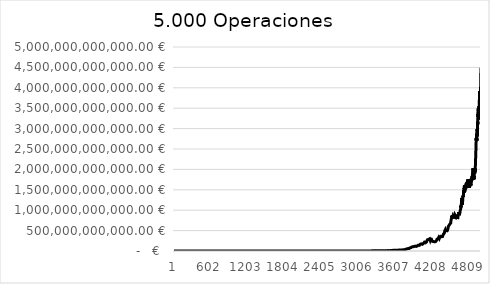
| Category | Series 0 |
|---|---|
| 0 | 10200 |
| 1 | 10404 |
| 2 | 10195.92 |
| 3 | 9992.002 |
| 4 | 10191.842 |
| 5 | 9988.005 |
| 6 | 9788.245 |
| 7 | 9592.48 |
| 8 | 9784.329 |
| 9 | 9588.643 |
| 10 | 9780.416 |
| 11 | 9584.807 |
| 12 | 9776.504 |
| 13 | 9580.973 |
| 14 | 9389.354 |
| 15 | 9201.567 |
| 16 | 9385.598 |
| 17 | 9573.31 |
| 18 | 9764.776 |
| 19 | 9960.072 |
| 20 | 9760.87 |
| 21 | 9956.088 |
| 22 | 9756.966 |
| 23 | 9952.105 |
| 24 | 10151.148 |
| 25 | 10354.171 |
| 26 | 10561.254 |
| 27 | 10772.479 |
| 28 | 10987.929 |
| 29 | 11207.687 |
| 30 | 11431.841 |
| 31 | 11660.478 |
| 32 | 11427.268 |
| 33 | 11198.723 |
| 34 | 11422.697 |
| 35 | 11651.151 |
| 36 | 11884.174 |
| 37 | 11646.491 |
| 38 | 11413.561 |
| 39 | 11641.832 |
| 40 | 11408.996 |
| 41 | 11180.816 |
| 42 | 11404.432 |
| 43 | 11176.343 |
| 44 | 10952.816 |
| 45 | 11171.873 |
| 46 | 11395.31 |
| 47 | 11623.216 |
| 48 | 11855.681 |
| 49 | 11618.567 |
| 50 | 11850.938 |
| 51 | 12087.957 |
| 52 | 12329.716 |
| 53 | 12083.122 |
| 54 | 12324.784 |
| 55 | 12571.28 |
| 56 | 12319.855 |
| 57 | 12566.252 |
| 58 | 12817.577 |
| 59 | 12561.225 |
| 60 | 12812.45 |
| 61 | 12556.201 |
| 62 | 12807.325 |
| 63 | 12551.178 |
| 64 | 12802.202 |
| 65 | 12546.158 |
| 66 | 12797.081 |
| 67 | 13053.022 |
| 68 | 12791.962 |
| 69 | 13047.801 |
| 70 | 13308.757 |
| 71 | 13042.582 |
| 72 | 12781.731 |
| 73 | 13037.365 |
| 74 | 13298.112 |
| 75 | 13564.075 |
| 76 | 13292.793 |
| 77 | 13026.937 |
| 78 | 12766.399 |
| 79 | 12511.071 |
| 80 | 12761.292 |
| 81 | 12506.066 |
| 82 | 12756.187 |
| 83 | 12501.064 |
| 84 | 12751.085 |
| 85 | 13006.107 |
| 86 | 13266.229 |
| 87 | 13000.904 |
| 88 | 13260.922 |
| 89 | 13526.141 |
| 90 | 13796.664 |
| 91 | 14072.597 |
| 92 | 14354.049 |
| 93 | 14641.13 |
| 94 | 14933.952 |
| 95 | 15232.631 |
| 96 | 15537.284 |
| 97 | 15848.03 |
| 98 | 15531.069 |
| 99 | 15220.448 |
| 100 | 14916.039 |
| 101 | 15214.36 |
| 102 | 14910.072 |
| 103 | 15208.274 |
| 104 | 14904.108 |
| 105 | 14606.026 |
| 106 | 14313.906 |
| 107 | 14600.184 |
| 108 | 14892.187 |
| 109 | 15190.031 |
| 110 | 14886.231 |
| 111 | 15183.955 |
| 112 | 15487.634 |
| 113 | 15797.387 |
| 114 | 16113.335 |
| 115 | 15791.068 |
| 116 | 16106.889 |
| 117 | 16429.027 |
| 118 | 16100.447 |
| 119 | 16422.456 |
| 120 | 16750.905 |
| 121 | 17085.923 |
| 122 | 17427.641 |
| 123 | 17776.194 |
| 124 | 18131.718 |
| 125 | 18494.352 |
| 126 | 18124.465 |
| 127 | 18486.955 |
| 128 | 18856.694 |
| 129 | 19233.828 |
| 130 | 19618.504 |
| 131 | 20010.874 |
| 132 | 20411.092 |
| 133 | 20002.87 |
| 134 | 20402.927 |
| 135 | 20810.986 |
| 136 | 20394.766 |
| 137 | 19986.871 |
| 138 | 20386.608 |
| 139 | 19978.876 |
| 140 | 20378.454 |
| 141 | 19970.884 |
| 142 | 19571.467 |
| 143 | 19180.037 |
| 144 | 19563.638 |
| 145 | 19172.365 |
| 146 | 18788.918 |
| 147 | 18413.14 |
| 148 | 18781.403 |
| 149 | 19157.031 |
| 150 | 19540.171 |
| 151 | 19930.975 |
| 152 | 20329.594 |
| 153 | 20736.186 |
| 154 | 21150.91 |
| 155 | 21573.928 |
| 156 | 21142.449 |
| 157 | 20719.6 |
| 158 | 21133.992 |
| 159 | 20711.313 |
| 160 | 20297.086 |
| 161 | 20703.028 |
| 162 | 21117.089 |
| 163 | 21539.43 |
| 164 | 21108.642 |
| 165 | 21530.815 |
| 166 | 21961.431 |
| 167 | 22400.659 |
| 168 | 22848.673 |
| 169 | 22391.699 |
| 170 | 22839.533 |
| 171 | 23296.324 |
| 172 | 23762.25 |
| 173 | 23287.005 |
| 174 | 22821.265 |
| 175 | 22364.84 |
| 176 | 21917.543 |
| 177 | 21479.192 |
| 178 | 21908.776 |
| 179 | 22346.952 |
| 180 | 21900.013 |
| 181 | 21462.012 |
| 182 | 21891.253 |
| 183 | 22329.078 |
| 184 | 22775.659 |
| 185 | 22320.146 |
| 186 | 22766.549 |
| 187 | 23221.88 |
| 188 | 22757.442 |
| 189 | 23212.591 |
| 190 | 23676.843 |
| 191 | 23203.306 |
| 192 | 22739.24 |
| 193 | 23194.025 |
| 194 | 23657.905 |
| 195 | 24131.063 |
| 196 | 23648.442 |
| 197 | 23175.473 |
| 198 | 22711.964 |
| 199 | 23166.203 |
| 200 | 23629.527 |
| 201 | 23156.937 |
| 202 | 22693.798 |
| 203 | 23147.674 |
| 204 | 23610.627 |
| 205 | 24082.84 |
| 206 | 23601.183 |
| 207 | 24073.207 |
| 208 | 23591.743 |
| 209 | 24063.577 |
| 210 | 24544.849 |
| 211 | 24053.952 |
| 212 | 23572.873 |
| 213 | 23101.415 |
| 214 | 23563.444 |
| 215 | 24034.713 |
| 216 | 24515.407 |
| 217 | 25005.715 |
| 218 | 25505.829 |
| 219 | 26015.946 |
| 220 | 25495.627 |
| 221 | 26005.54 |
| 222 | 26525.65 |
| 223 | 27056.163 |
| 224 | 27597.287 |
| 225 | 28149.232 |
| 226 | 28712.217 |
| 227 | 28137.973 |
| 228 | 28700.732 |
| 229 | 29274.747 |
| 230 | 29860.242 |
| 231 | 30457.447 |
| 232 | 29848.298 |
| 233 | 30445.264 |
| 234 | 31054.169 |
| 235 | 30433.085 |
| 236 | 31041.747 |
| 237 | 30420.912 |
| 238 | 31029.33 |
| 239 | 31649.917 |
| 240 | 32282.915 |
| 241 | 31637.257 |
| 242 | 32270.002 |
| 243 | 32915.402 |
| 244 | 32257.094 |
| 245 | 32902.236 |
| 246 | 32244.191 |
| 247 | 32889.075 |
| 248 | 32231.294 |
| 249 | 32875.92 |
| 250 | 32218.401 |
| 251 | 32862.769 |
| 252 | 33520.025 |
| 253 | 32849.624 |
| 254 | 32192.632 |
| 255 | 31548.779 |
| 256 | 32179.755 |
| 257 | 32823.35 |
| 258 | 32166.883 |
| 259 | 31523.545 |
| 260 | 32154.016 |
| 261 | 32797.096 |
| 262 | 33453.038 |
| 263 | 34122.099 |
| 264 | 33439.657 |
| 265 | 34108.45 |
| 266 | 34790.619 |
| 267 | 35486.432 |
| 268 | 34776.703 |
| 269 | 35472.237 |
| 270 | 36181.682 |
| 271 | 36905.315 |
| 272 | 36167.209 |
| 273 | 36890.553 |
| 274 | 36152.742 |
| 275 | 36875.797 |
| 276 | 36138.281 |
| 277 | 36861.047 |
| 278 | 36123.826 |
| 279 | 36846.302 |
| 280 | 36109.376 |
| 281 | 36831.564 |
| 282 | 36094.932 |
| 283 | 36816.831 |
| 284 | 37553.168 |
| 285 | 38304.231 |
| 286 | 37538.146 |
| 287 | 36787.384 |
| 288 | 37523.131 |
| 289 | 36772.669 |
| 290 | 37508.122 |
| 291 | 38258.284 |
| 292 | 37493.119 |
| 293 | 38242.981 |
| 294 | 39007.841 |
| 295 | 39787.997 |
| 296 | 40583.757 |
| 297 | 39772.082 |
| 298 | 40567.524 |
| 299 | 41378.874 |
| 300 | 42206.452 |
| 301 | 43050.581 |
| 302 | 42189.569 |
| 303 | 43033.361 |
| 304 | 43894.028 |
| 305 | 44771.908 |
| 306 | 43876.47 |
| 307 | 44754 |
| 308 | 45649.08 |
| 309 | 46562.061 |
| 310 | 47493.303 |
| 311 | 48443.169 |
| 312 | 49412.032 |
| 313 | 48423.791 |
| 314 | 47455.315 |
| 315 | 48404.422 |
| 316 | 49372.51 |
| 317 | 48385.06 |
| 318 | 49352.761 |
| 319 | 50339.816 |
| 320 | 49333.02 |
| 321 | 48346.36 |
| 322 | 47379.433 |
| 323 | 46431.844 |
| 324 | 45503.207 |
| 325 | 46413.271 |
| 326 | 47341.537 |
| 327 | 46394.706 |
| 328 | 47322.6 |
| 329 | 48269.052 |
| 330 | 49234.433 |
| 331 | 48249.744 |
| 332 | 49214.739 |
| 333 | 50199.034 |
| 334 | 51203.015 |
| 335 | 50178.954 |
| 336 | 51182.533 |
| 337 | 52206.184 |
| 338 | 51162.06 |
| 339 | 50138.819 |
| 340 | 49136.043 |
| 341 | 50118.764 |
| 342 | 49116.388 |
| 343 | 50098.716 |
| 344 | 49096.742 |
| 345 | 48114.807 |
| 346 | 49077.103 |
| 347 | 50058.645 |
| 348 | 51059.818 |
| 349 | 52081.015 |
| 350 | 53122.635 |
| 351 | 52060.182 |
| 352 | 51018.978 |
| 353 | 52039.358 |
| 354 | 50998.571 |
| 355 | 52018.542 |
| 356 | 50978.171 |
| 357 | 51997.735 |
| 358 | 50957.78 |
| 359 | 49938.625 |
| 360 | 50937.397 |
| 361 | 49918.649 |
| 362 | 50917.022 |
| 363 | 49898.682 |
| 364 | 50896.655 |
| 365 | 51914.588 |
| 366 | 50876.297 |
| 367 | 49858.771 |
| 368 | 50855.946 |
| 369 | 51873.065 |
| 370 | 50835.604 |
| 371 | 49818.892 |
| 372 | 48822.514 |
| 373 | 49798.964 |
| 374 | 48802.985 |
| 375 | 49779.045 |
| 376 | 48783.464 |
| 377 | 49759.133 |
| 378 | 50754.316 |
| 379 | 49739.229 |
| 380 | 50734.014 |
| 381 | 51748.694 |
| 382 | 52783.668 |
| 383 | 51727.995 |
| 384 | 50693.435 |
| 385 | 49679.566 |
| 386 | 48685.975 |
| 387 | 49659.694 |
| 388 | 50652.888 |
| 389 | 49639.83 |
| 390 | 50632.627 |
| 391 | 49619.974 |
| 392 | 48627.575 |
| 393 | 47655.023 |
| 394 | 46701.923 |
| 395 | 47635.961 |
| 396 | 46683.242 |
| 397 | 47616.907 |
| 398 | 48569.245 |
| 399 | 49540.63 |
| 400 | 50531.443 |
| 401 | 51542.072 |
| 402 | 52572.913 |
| 403 | 53624.371 |
| 404 | 54696.859 |
| 405 | 55790.796 |
| 406 | 54674.98 |
| 407 | 53581.48 |
| 408 | 54653.11 |
| 409 | 53560.048 |
| 410 | 54631.249 |
| 411 | 55723.874 |
| 412 | 56838.351 |
| 413 | 57975.118 |
| 414 | 56815.616 |
| 415 | 55679.303 |
| 416 | 56792.89 |
| 417 | 57928.747 |
| 418 | 59087.322 |
| 419 | 60269.069 |
| 420 | 59063.687 |
| 421 | 60244.961 |
| 422 | 61449.86 |
| 423 | 60220.863 |
| 424 | 61425.28 |
| 425 | 62653.786 |
| 426 | 63906.862 |
| 427 | 65184.999 |
| 428 | 66488.699 |
| 429 | 65158.925 |
| 430 | 66462.103 |
| 431 | 65132.861 |
| 432 | 63830.204 |
| 433 | 62553.6 |
| 434 | 63804.672 |
| 435 | 65080.765 |
| 436 | 66382.381 |
| 437 | 65054.733 |
| 438 | 66355.828 |
| 439 | 67682.944 |
| 440 | 66329.286 |
| 441 | 65002.7 |
| 442 | 63702.646 |
| 443 | 62428.593 |
| 444 | 63677.165 |
| 445 | 62403.621 |
| 446 | 61155.549 |
| 447 | 62378.66 |
| 448 | 63626.233 |
| 449 | 64898.758 |
| 450 | 66196.733 |
| 451 | 64872.798 |
| 452 | 63575.342 |
| 453 | 62303.836 |
| 454 | 63549.912 |
| 455 | 64820.91 |
| 456 | 63524.492 |
| 457 | 62254.002 |
| 458 | 63499.082 |
| 459 | 64769.064 |
| 460 | 66064.445 |
| 461 | 67385.734 |
| 462 | 68733.449 |
| 463 | 70108.118 |
| 464 | 71510.28 |
| 465 | 70080.075 |
| 466 | 68678.473 |
| 467 | 67304.904 |
| 468 | 68651.002 |
| 469 | 70024.022 |
| 470 | 68623.541 |
| 471 | 67251.071 |
| 472 | 68596.092 |
| 473 | 69968.014 |
| 474 | 71367.374 |
| 475 | 72794.722 |
| 476 | 74250.616 |
| 477 | 75735.628 |
| 478 | 74220.916 |
| 479 | 72736.498 |
| 480 | 71281.768 |
| 481 | 69856.132 |
| 482 | 71253.255 |
| 483 | 72678.32 |
| 484 | 74131.886 |
| 485 | 72649.249 |
| 486 | 74102.234 |
| 487 | 75584.278 |
| 488 | 77095.964 |
| 489 | 78637.883 |
| 490 | 80210.641 |
| 491 | 81814.854 |
| 492 | 83451.151 |
| 493 | 85120.174 |
| 494 | 86822.577 |
| 495 | 85086.126 |
| 496 | 86787.848 |
| 497 | 85052.091 |
| 498 | 86753.133 |
| 499 | 85018.07 |
| 500 | 83317.709 |
| 501 | 84984.063 |
| 502 | 83284.382 |
| 503 | 84950.069 |
| 504 | 83251.068 |
| 505 | 84916.089 |
| 506 | 86614.411 |
| 507 | 88346.699 |
| 508 | 90113.633 |
| 509 | 91915.906 |
| 510 | 93754.224 |
| 511 | 91879.14 |
| 512 | 93716.723 |
| 513 | 95591.057 |
| 514 | 93679.236 |
| 515 | 91805.651 |
| 516 | 89969.538 |
| 517 | 91768.929 |
| 518 | 89933.55 |
| 519 | 91732.221 |
| 520 | 93566.866 |
| 521 | 95438.203 |
| 522 | 97346.967 |
| 523 | 99293.906 |
| 524 | 97308.028 |
| 525 | 95361.868 |
| 526 | 97269.105 |
| 527 | 99214.487 |
| 528 | 101198.777 |
| 529 | 99174.801 |
| 530 | 101158.297 |
| 531 | 103181.463 |
| 532 | 101117.834 |
| 533 | 99095.477 |
| 534 | 101077.387 |
| 535 | 99055.839 |
| 536 | 101036.956 |
| 537 | 103057.695 |
| 538 | 100996.541 |
| 539 | 98976.61 |
| 540 | 100956.143 |
| 541 | 102975.266 |
| 542 | 105034.771 |
| 543 | 107135.466 |
| 544 | 109278.176 |
| 545 | 111463.739 |
| 546 | 113693.014 |
| 547 | 111419.154 |
| 548 | 113647.537 |
| 549 | 115920.487 |
| 550 | 113602.078 |
| 551 | 111330.036 |
| 552 | 113556.637 |
| 553 | 115827.77 |
| 554 | 113511.214 |
| 555 | 115781.438 |
| 556 | 113465.81 |
| 557 | 111196.493 |
| 558 | 108972.564 |
| 559 | 111152.015 |
| 560 | 113375.055 |
| 561 | 115642.556 |
| 562 | 117955.407 |
| 563 | 115596.299 |
| 564 | 117908.225 |
| 565 | 120266.39 |
| 566 | 117861.062 |
| 567 | 115503.841 |
| 568 | 117813.918 |
| 569 | 120170.196 |
| 570 | 117766.792 |
| 571 | 115411.456 |
| 572 | 117719.685 |
| 573 | 120074.079 |
| 574 | 122475.561 |
| 575 | 120026.049 |
| 576 | 117625.528 |
| 577 | 119978.039 |
| 578 | 122377.6 |
| 579 | 124825.152 |
| 580 | 127321.655 |
| 581 | 124775.222 |
| 582 | 122279.717 |
| 583 | 124725.312 |
| 584 | 127219.818 |
| 585 | 129764.214 |
| 586 | 127168.93 |
| 587 | 129712.308 |
| 588 | 132306.555 |
| 589 | 129660.423 |
| 590 | 132253.632 |
| 591 | 134898.705 |
| 592 | 132200.73 |
| 593 | 134844.745 |
| 594 | 137541.64 |
| 595 | 140292.473 |
| 596 | 143098.322 |
| 597 | 145960.289 |
| 598 | 148879.494 |
| 599 | 145901.905 |
| 600 | 148819.943 |
| 601 | 145843.544 |
| 602 | 148760.415 |
| 603 | 151735.623 |
| 604 | 154770.335 |
| 605 | 157865.742 |
| 606 | 161023.057 |
| 607 | 164243.518 |
| 608 | 167528.389 |
| 609 | 164177.821 |
| 610 | 167461.377 |
| 611 | 164112.15 |
| 612 | 160829.907 |
| 613 | 157613.308 |
| 614 | 160765.575 |
| 615 | 157550.263 |
| 616 | 154399.258 |
| 617 | 157487.243 |
| 618 | 154337.498 |
| 619 | 151250.748 |
| 620 | 154275.763 |
| 621 | 157361.278 |
| 622 | 154214.053 |
| 623 | 151129.772 |
| 624 | 148107.176 |
| 625 | 145145.033 |
| 626 | 148047.934 |
| 627 | 151008.892 |
| 628 | 147988.714 |
| 629 | 150948.489 |
| 630 | 147929.519 |
| 631 | 144970.928 |
| 632 | 147870.347 |
| 633 | 144912.94 |
| 634 | 147811.199 |
| 635 | 150767.423 |
| 636 | 147752.074 |
| 637 | 144797.033 |
| 638 | 147692.974 |
| 639 | 144739.114 |
| 640 | 147633.896 |
| 641 | 150586.574 |
| 642 | 153598.306 |
| 643 | 150526.34 |
| 644 | 153536.867 |
| 645 | 156607.604 |
| 646 | 153475.452 |
| 647 | 156544.961 |
| 648 | 159675.86 |
| 649 | 162869.377 |
| 650 | 166126.765 |
| 651 | 169449.3 |
| 652 | 166060.314 |
| 653 | 169381.52 |
| 654 | 172769.151 |
| 655 | 169313.768 |
| 656 | 172700.043 |
| 657 | 176154.044 |
| 658 | 179677.125 |
| 659 | 183270.667 |
| 660 | 186936.081 |
| 661 | 190674.802 |
| 662 | 186861.306 |
| 663 | 190598.532 |
| 664 | 194410.503 |
| 665 | 190522.293 |
| 666 | 186711.847 |
| 667 | 182977.61 |
| 668 | 179318.058 |
| 669 | 182904.419 |
| 670 | 179246.331 |
| 671 | 182831.257 |
| 672 | 179174.632 |
| 673 | 175591.14 |
| 674 | 179102.962 |
| 675 | 182685.022 |
| 676 | 186338.722 |
| 677 | 190065.496 |
| 678 | 193866.806 |
| 679 | 197744.143 |
| 680 | 193789.26 |
| 681 | 189913.474 |
| 682 | 193711.744 |
| 683 | 197585.979 |
| 684 | 193634.259 |
| 685 | 197506.944 |
| 686 | 193556.806 |
| 687 | 197427.942 |
| 688 | 193479.383 |
| 689 | 197348.971 |
| 690 | 201295.95 |
| 691 | 205321.869 |
| 692 | 201215.432 |
| 693 | 197191.123 |
| 694 | 201134.945 |
| 695 | 205157.644 |
| 696 | 209260.797 |
| 697 | 213446.013 |
| 698 | 217714.933 |
| 699 | 213360.635 |
| 700 | 209093.422 |
| 701 | 213275.29 |
| 702 | 209009.785 |
| 703 | 213189.98 |
| 704 | 217453.78 |
| 705 | 213104.704 |
| 706 | 217366.798 |
| 707 | 221714.134 |
| 708 | 226148.417 |
| 709 | 221625.449 |
| 710 | 226057.958 |
| 711 | 230579.117 |
| 712 | 235190.699 |
| 713 | 239894.513 |
| 714 | 244692.403 |
| 715 | 249586.252 |
| 716 | 244594.526 |
| 717 | 249486.417 |
| 718 | 254476.145 |
| 719 | 259565.668 |
| 720 | 254374.355 |
| 721 | 259461.842 |
| 722 | 264651.079 |
| 723 | 269944.1 |
| 724 | 275342.982 |
| 725 | 280849.842 |
| 726 | 286466.839 |
| 727 | 280737.502 |
| 728 | 275122.752 |
| 729 | 269620.297 |
| 730 | 264227.891 |
| 731 | 269512.449 |
| 732 | 264122.2 |
| 733 | 269404.644 |
| 734 | 264016.551 |
| 735 | 269296.882 |
| 736 | 274682.82 |
| 737 | 280176.476 |
| 738 | 285780.006 |
| 739 | 291495.606 |
| 740 | 297325.518 |
| 741 | 291379.008 |
| 742 | 285551.427 |
| 743 | 279840.399 |
| 744 | 285437.207 |
| 745 | 279728.463 |
| 746 | 285323.032 |
| 747 | 279616.571 |
| 748 | 274024.24 |
| 749 | 279504.725 |
| 750 | 273914.63 |
| 751 | 279392.923 |
| 752 | 284980.781 |
| 753 | 279281.166 |
| 754 | 273695.542 |
| 755 | 279169.453 |
| 756 | 284752.842 |
| 757 | 279057.785 |
| 758 | 284638.941 |
| 759 | 278946.162 |
| 760 | 273367.239 |
| 761 | 278834.584 |
| 762 | 284411.275 |
| 763 | 278723.05 |
| 764 | 284297.511 |
| 765 | 289983.461 |
| 766 | 295783.13 |
| 767 | 301698.793 |
| 768 | 307732.769 |
| 769 | 301578.113 |
| 770 | 295546.551 |
| 771 | 289635.62 |
| 772 | 295428.333 |
| 773 | 301336.899 |
| 774 | 307363.637 |
| 775 | 313510.91 |
| 776 | 319781.128 |
| 777 | 326176.751 |
| 778 | 319653.216 |
| 779 | 313260.151 |
| 780 | 319525.354 |
| 781 | 325915.862 |
| 782 | 319397.544 |
| 783 | 313009.593 |
| 784 | 306749.402 |
| 785 | 312884.39 |
| 786 | 306626.702 |
| 787 | 312759.236 |
| 788 | 319014.421 |
| 789 | 325394.709 |
| 790 | 331902.603 |
| 791 | 325264.551 |
| 792 | 331769.842 |
| 793 | 325134.445 |
| 794 | 331637.134 |
| 795 | 338269.877 |
| 796 | 331504.479 |
| 797 | 338134.569 |
| 798 | 331371.877 |
| 799 | 324744.44 |
| 800 | 331239.329 |
| 801 | 324614.542 |
| 802 | 318122.251 |
| 803 | 311759.806 |
| 804 | 317995.002 |
| 805 | 311635.102 |
| 806 | 317867.804 |
| 807 | 311510.448 |
| 808 | 317740.657 |
| 809 | 324095.47 |
| 810 | 330577.38 |
| 811 | 323965.832 |
| 812 | 330445.149 |
| 813 | 337054.052 |
| 814 | 330312.971 |
| 815 | 336919.23 |
| 816 | 330180.846 |
| 817 | 323577.229 |
| 818 | 330048.773 |
| 819 | 336649.749 |
| 820 | 343382.744 |
| 821 | 350250.399 |
| 822 | 357255.407 |
| 823 | 364400.515 |
| 824 | 371688.525 |
| 825 | 364254.755 |
| 826 | 356969.659 |
| 827 | 364109.053 |
| 828 | 371391.234 |
| 829 | 363963.409 |
| 830 | 371242.677 |
| 831 | 378667.531 |
| 832 | 371094.18 |
| 833 | 378516.064 |
| 834 | 386086.385 |
| 835 | 378364.657 |
| 836 | 370797.364 |
| 837 | 363381.417 |
| 838 | 370649.045 |
| 839 | 378062.026 |
| 840 | 385623.267 |
| 841 | 377910.801 |
| 842 | 370352.585 |
| 843 | 362945.534 |
| 844 | 370204.444 |
| 845 | 362800.355 |
| 846 | 370056.362 |
| 847 | 362655.235 |
| 848 | 369908.34 |
| 849 | 377306.507 |
| 850 | 384852.637 |
| 851 | 377155.584 |
| 852 | 369612.472 |
| 853 | 377004.722 |
| 854 | 384544.816 |
| 855 | 376853.92 |
| 856 | 384390.998 |
| 857 | 392078.818 |
| 858 | 399920.395 |
| 859 | 391921.987 |
| 860 | 399760.427 |
| 861 | 407755.635 |
| 862 | 399600.522 |
| 863 | 391608.512 |
| 864 | 399440.682 |
| 865 | 391451.869 |
| 866 | 383622.831 |
| 867 | 375950.375 |
| 868 | 368431.367 |
| 869 | 361062.74 |
| 870 | 368283.994 |
| 871 | 360918.315 |
| 872 | 368136.681 |
| 873 | 375499.415 |
| 874 | 383009.403 |
| 875 | 375349.215 |
| 876 | 382856.199 |
| 877 | 375199.075 |
| 878 | 367695.094 |
| 879 | 375048.995 |
| 880 | 382549.975 |
| 881 | 374898.976 |
| 882 | 382396.955 |
| 883 | 390044.894 |
| 884 | 382243.997 |
| 885 | 389888.876 |
| 886 | 397686.654 |
| 887 | 405640.387 |
| 888 | 397527.579 |
| 889 | 405478.131 |
| 890 | 397368.568 |
| 891 | 389421.197 |
| 892 | 397209.621 |
| 893 | 405153.813 |
| 894 | 397050.737 |
| 895 | 404991.752 |
| 896 | 396891.917 |
| 897 | 388954.078 |
| 898 | 396733.16 |
| 899 | 388798.497 |
| 900 | 396574.467 |
| 901 | 388642.977 |
| 902 | 396415.837 |
| 903 | 404344.154 |
| 904 | 396257.271 |
| 905 | 388332.125 |
| 906 | 380565.483 |
| 907 | 372954.173 |
| 908 | 380413.256 |
| 909 | 388021.522 |
| 910 | 380261.091 |
| 911 | 372655.869 |
| 912 | 380108.987 |
| 913 | 372506.807 |
| 914 | 365056.671 |
| 915 | 357755.537 |
| 916 | 350600.427 |
| 917 | 357612.435 |
| 918 | 350460.187 |
| 919 | 357469.39 |
| 920 | 350320.002 |
| 921 | 357326.403 |
| 922 | 364472.931 |
| 923 | 371762.389 |
| 924 | 364327.141 |
| 925 | 357040.599 |
| 926 | 364181.411 |
| 927 | 356897.782 |
| 928 | 349759.827 |
| 929 | 356755.023 |
| 930 | 349619.923 |
| 931 | 342627.524 |
| 932 | 335774.974 |
| 933 | 329059.474 |
| 934 | 322478.285 |
| 935 | 316028.719 |
| 936 | 322349.294 |
| 937 | 315902.308 |
| 938 | 322220.354 |
| 939 | 315775.947 |
| 940 | 322091.466 |
| 941 | 328533.295 |
| 942 | 321962.629 |
| 943 | 328401.882 |
| 944 | 334969.919 |
| 945 | 341669.318 |
| 946 | 348502.704 |
| 947 | 341532.65 |
| 948 | 334701.997 |
| 949 | 341396.037 |
| 950 | 334568.116 |
| 951 | 327876.754 |
| 952 | 334434.289 |
| 953 | 341122.975 |
| 954 | 347945.434 |
| 955 | 354904.343 |
| 956 | 362002.43 |
| 957 | 369242.478 |
| 958 | 376627.328 |
| 959 | 369094.781 |
| 960 | 376476.677 |
| 961 | 368947.143 |
| 962 | 361568.201 |
| 963 | 354336.837 |
| 964 | 347250.1 |
| 965 | 354195.102 |
| 966 | 347111.2 |
| 967 | 354053.424 |
| 968 | 361134.492 |
| 969 | 353911.802 |
| 970 | 360990.038 |
| 971 | 368209.839 |
| 972 | 375574.036 |
| 973 | 368062.555 |
| 974 | 360701.304 |
| 975 | 367915.33 |
| 976 | 375273.637 |
| 977 | 367768.164 |
| 978 | 360412.801 |
| 979 | 367621.057 |
| 980 | 374973.478 |
| 981 | 367474.008 |
| 982 | 374823.489 |
| 983 | 382319.958 |
| 984 | 374673.559 |
| 985 | 367180.088 |
| 986 | 359836.486 |
| 987 | 367033.216 |
| 988 | 374373.88 |
| 989 | 381861.358 |
| 990 | 389498.585 |
| 991 | 397288.557 |
| 992 | 405234.328 |
| 993 | 413339.014 |
| 994 | 421605.795 |
| 995 | 413173.679 |
| 996 | 404910.205 |
| 997 | 396812.001 |
| 998 | 404748.241 |
| 999 | 412843.206 |
| 1000 | 421100.07 |
| 1001 | 412678.069 |
| 1002 | 420931.63 |
| 1003 | 429350.263 |
| 1004 | 420763.257 |
| 1005 | 412347.992 |
| 1006 | 420594.952 |
| 1007 | 412183.053 |
| 1008 | 403939.392 |
| 1009 | 395860.604 |
| 1010 | 403777.816 |
| 1011 | 411853.373 |
| 1012 | 420090.44 |
| 1013 | 411688.631 |
| 1014 | 403454.859 |
| 1015 | 395385.761 |
| 1016 | 403293.477 |
| 1017 | 395227.607 |
| 1018 | 403132.159 |
| 1019 | 411194.803 |
| 1020 | 419418.699 |
| 1021 | 427807.073 |
| 1022 | 419250.931 |
| 1023 | 410865.912 |
| 1024 | 402648.594 |
| 1025 | 394595.622 |
| 1026 | 402487.535 |
| 1027 | 410537.285 |
| 1028 | 402326.54 |
| 1029 | 410373.071 |
| 1030 | 418580.532 |
| 1031 | 426952.143 |
| 1032 | 435491.185 |
| 1033 | 444201.009 |
| 1034 | 453085.029 |
| 1035 | 444023.329 |
| 1036 | 452903.795 |
| 1037 | 443845.719 |
| 1038 | 434968.805 |
| 1039 | 426269.429 |
| 1040 | 434794.818 |
| 1041 | 443490.714 |
| 1042 | 452360.528 |
| 1043 | 461407.739 |
| 1044 | 470635.893 |
| 1045 | 480048.611 |
| 1046 | 489649.584 |
| 1047 | 499442.575 |
| 1048 | 509431.427 |
| 1049 | 499242.798 |
| 1050 | 489257.942 |
| 1051 | 499043.101 |
| 1052 | 489062.239 |
| 1053 | 479280.994 |
| 1054 | 469695.374 |
| 1055 | 479089.282 |
| 1056 | 488671.068 |
| 1057 | 498444.489 |
| 1058 | 508413.379 |
| 1059 | 518581.646 |
| 1060 | 528953.279 |
| 1061 | 518374.214 |
| 1062 | 528741.698 |
| 1063 | 518166.864 |
| 1064 | 528530.201 |
| 1065 | 539100.805 |
| 1066 | 528318.789 |
| 1067 | 538885.165 |
| 1068 | 549662.868 |
| 1069 | 538669.611 |
| 1070 | 527896.219 |
| 1071 | 538454.143 |
| 1072 | 549223.226 |
| 1073 | 560207.69 |
| 1074 | 571411.844 |
| 1075 | 582840.081 |
| 1076 | 594496.883 |
| 1077 | 582606.945 |
| 1078 | 570954.806 |
| 1079 | 582373.902 |
| 1080 | 594021.38 |
| 1081 | 605901.808 |
| 1082 | 618019.844 |
| 1083 | 605659.447 |
| 1084 | 617772.636 |
| 1085 | 630128.089 |
| 1086 | 642730.651 |
| 1087 | 655585.264 |
| 1088 | 668696.969 |
| 1089 | 682070.908 |
| 1090 | 668429.49 |
| 1091 | 681798.08 |
| 1092 | 695434.041 |
| 1093 | 681525.361 |
| 1094 | 695155.868 |
| 1095 | 709058.985 |
| 1096 | 694877.806 |
| 1097 | 708775.362 |
| 1098 | 722950.869 |
| 1099 | 708491.851 |
| 1100 | 694322.014 |
| 1101 | 708208.455 |
| 1102 | 694044.286 |
| 1103 | 707925.171 |
| 1104 | 693766.668 |
| 1105 | 707642.001 |
| 1106 | 721794.841 |
| 1107 | 736230.738 |
| 1108 | 721506.123 |
| 1109 | 735936.246 |
| 1110 | 750654.971 |
| 1111 | 765668.07 |
| 1112 | 780981.432 |
| 1113 | 796601.06 |
| 1114 | 812533.081 |
| 1115 | 796282.42 |
| 1116 | 780356.771 |
| 1117 | 764749.636 |
| 1118 | 749454.643 |
| 1119 | 734465.55 |
| 1120 | 719776.239 |
| 1121 | 705380.715 |
| 1122 | 719488.329 |
| 1123 | 705098.562 |
| 1124 | 690996.591 |
| 1125 | 704816.523 |
| 1126 | 718912.853 |
| 1127 | 733291.11 |
| 1128 | 747956.933 |
| 1129 | 762916.071 |
| 1130 | 747657.75 |
| 1131 | 762610.905 |
| 1132 | 747358.687 |
| 1133 | 732411.513 |
| 1134 | 717763.283 |
| 1135 | 732118.548 |
| 1136 | 746760.919 |
| 1137 | 761696.138 |
| 1138 | 776930.061 |
| 1139 | 792468.662 |
| 1140 | 808318.035 |
| 1141 | 824484.396 |
| 1142 | 807994.708 |
| 1143 | 824154.602 |
| 1144 | 807671.51 |
| 1145 | 823824.94 |
| 1146 | 840301.439 |
| 1147 | 857107.468 |
| 1148 | 874249.617 |
| 1149 | 856764.625 |
| 1150 | 839629.332 |
| 1151 | 856421.919 |
| 1152 | 873550.357 |
| 1153 | 856079.35 |
| 1154 | 838957.763 |
| 1155 | 855736.918 |
| 1156 | 838622.18 |
| 1157 | 821849.736 |
| 1158 | 838286.731 |
| 1159 | 855052.466 |
| 1160 | 872153.515 |
| 1161 | 889596.585 |
| 1162 | 907388.517 |
| 1163 | 925536.287 |
| 1164 | 907025.562 |
| 1165 | 925166.073 |
| 1166 | 906662.751 |
| 1167 | 924796.006 |
| 1168 | 943291.927 |
| 1169 | 924426.088 |
| 1170 | 942914.61 |
| 1171 | 961772.902 |
| 1172 | 942537.444 |
| 1173 | 923686.695 |
| 1174 | 905212.961 |
| 1175 | 923317.22 |
| 1176 | 941783.565 |
| 1177 | 960619.236 |
| 1178 | 979831.621 |
| 1179 | 999428.253 |
| 1180 | 1019416.818 |
| 1181 | 1039805.155 |
| 1182 | 1060601.258 |
| 1183 | 1081813.283 |
| 1184 | 1103449.549 |
| 1185 | 1081380.558 |
| 1186 | 1103008.169 |
| 1187 | 1125068.332 |
| 1188 | 1102566.965 |
| 1189 | 1124618.305 |
| 1190 | 1147110.671 |
| 1191 | 1124168.457 |
| 1192 | 1146651.827 |
| 1193 | 1123718.79 |
| 1194 | 1101244.414 |
| 1195 | 1079219.526 |
| 1196 | 1100803.916 |
| 1197 | 1122819.995 |
| 1198 | 1145276.395 |
| 1199 | 1168181.923 |
| 1200 | 1191545.561 |
| 1201 | 1167714.65 |
| 1202 | 1191068.943 |
| 1203 | 1167247.564 |
| 1204 | 1143902.613 |
| 1205 | 1166780.665 |
| 1206 | 1190116.278 |
| 1207 | 1166313.953 |
| 1208 | 1189640.232 |
| 1209 | 1213433.036 |
| 1210 | 1237701.697 |
| 1211 | 1262455.731 |
| 1212 | 1237206.616 |
| 1213 | 1212462.484 |
| 1214 | 1188213.234 |
| 1215 | 1211977.499 |
| 1216 | 1236217.049 |
| 1217 | 1211492.708 |
| 1218 | 1187262.854 |
| 1219 | 1211008.111 |
| 1220 | 1235228.273 |
| 1221 | 1259932.839 |
| 1222 | 1285131.495 |
| 1223 | 1259428.866 |
| 1224 | 1284617.443 |
| 1225 | 1310309.792 |
| 1226 | 1284103.596 |
| 1227 | 1309785.668 |
| 1228 | 1283589.954 |
| 1229 | 1309261.754 |
| 1230 | 1335446.989 |
| 1231 | 1362155.928 |
| 1232 | 1334912.81 |
| 1233 | 1361611.066 |
| 1234 | 1388843.287 |
| 1235 | 1416620.153 |
| 1236 | 1444952.556 |
| 1237 | 1416053.505 |
| 1238 | 1444374.575 |
| 1239 | 1473262.067 |
| 1240 | 1502727.308 |
| 1241 | 1472672.762 |
| 1242 | 1502126.217 |
| 1243 | 1472083.693 |
| 1244 | 1501525.367 |
| 1245 | 1471494.859 |
| 1246 | 1442064.962 |
| 1247 | 1413223.663 |
| 1248 | 1441488.136 |
| 1249 | 1412658.373 |
| 1250 | 1384405.206 |
| 1251 | 1412093.31 |
| 1252 | 1440335.176 |
| 1253 | 1411528.473 |
| 1254 | 1383297.903 |
| 1255 | 1355631.945 |
| 1256 | 1328519.306 |
| 1257 | 1301948.92 |
| 1258 | 1275909.942 |
| 1259 | 1250391.743 |
| 1260 | 1225383.908 |
| 1261 | 1249891.586 |
| 1262 | 1224893.754 |
| 1263 | 1249391.63 |
| 1264 | 1274379.462 |
| 1265 | 1248891.873 |
| 1266 | 1273869.71 |
| 1267 | 1299347.105 |
| 1268 | 1325334.047 |
| 1269 | 1351840.728 |
| 1270 | 1324803.913 |
| 1271 | 1298307.835 |
| 1272 | 1324273.991 |
| 1273 | 1350759.471 |
| 1274 | 1323744.282 |
| 1275 | 1297269.396 |
| 1276 | 1271324.008 |
| 1277 | 1245897.528 |
| 1278 | 1220979.578 |
| 1279 | 1196559.986 |
| 1280 | 1172628.786 |
| 1281 | 1149176.211 |
| 1282 | 1126192.686 |
| 1283 | 1148716.54 |
| 1284 | 1125742.209 |
| 1285 | 1148257.053 |
| 1286 | 1125291.912 |
| 1287 | 1147797.751 |
| 1288 | 1170753.706 |
| 1289 | 1147338.632 |
| 1290 | 1170285.404 |
| 1291 | 1146879.696 |
| 1292 | 1123942.102 |
| 1293 | 1101463.26 |
| 1294 | 1079433.995 |
| 1295 | 1101022.675 |
| 1296 | 1123043.128 |
| 1297 | 1145503.991 |
| 1298 | 1122593.911 |
| 1299 | 1145045.789 |
| 1300 | 1167946.705 |
| 1301 | 1191305.639 |
| 1302 | 1167479.526 |
| 1303 | 1144129.936 |
| 1304 | 1121247.337 |
| 1305 | 1098822.39 |
| 1306 | 1076845.943 |
| 1307 | 1098382.861 |
| 1308 | 1076415.204 |
| 1309 | 1097943.508 |
| 1310 | 1119902.378 |
| 1311 | 1142300.426 |
| 1312 | 1165146.435 |
| 1313 | 1188449.363 |
| 1314 | 1164680.376 |
| 1315 | 1187973.984 |
| 1316 | 1211733.463 |
| 1317 | 1187498.794 |
| 1318 | 1211248.77 |
| 1319 | 1235473.745 |
| 1320 | 1260183.22 |
| 1321 | 1285386.884 |
| 1322 | 1311094.622 |
| 1323 | 1284872.73 |
| 1324 | 1310570.184 |
| 1325 | 1336781.588 |
| 1326 | 1363517.22 |
| 1327 | 1390787.564 |
| 1328 | 1418603.315 |
| 1329 | 1446975.382 |
| 1330 | 1475914.889 |
| 1331 | 1446396.592 |
| 1332 | 1475324.523 |
| 1333 | 1504831.014 |
| 1334 | 1534927.634 |
| 1335 | 1565626.187 |
| 1336 | 1534313.663 |
| 1337 | 1564999.936 |
| 1338 | 1533699.938 |
| 1339 | 1503025.939 |
| 1340 | 1533086.458 |
| 1341 | 1563748.187 |
| 1342 | 1532473.223 |
| 1343 | 1501823.759 |
| 1344 | 1531860.234 |
| 1345 | 1562497.439 |
| 1346 | 1593747.387 |
| 1347 | 1625622.335 |
| 1348 | 1658134.782 |
| 1349 | 1691297.477 |
| 1350 | 1725123.427 |
| 1351 | 1759625.895 |
| 1352 | 1794818.413 |
| 1353 | 1830714.782 |
| 1354 | 1867329.077 |
| 1355 | 1904675.659 |
| 1356 | 1866582.146 |
| 1357 | 1829250.503 |
| 1358 | 1865835.513 |
| 1359 | 1903152.223 |
| 1360 | 1941215.267 |
| 1361 | 1980039.573 |
| 1362 | 2019640.364 |
| 1363 | 2060033.172 |
| 1364 | 2018832.508 |
| 1365 | 2059209.158 |
| 1366 | 2018024.975 |
| 1367 | 2058385.475 |
| 1368 | 2017217.765 |
| 1369 | 1976873.41 |
| 1370 | 2016410.878 |
| 1371 | 2056739.096 |
| 1372 | 2097873.878 |
| 1373 | 2139831.355 |
| 1374 | 2182627.982 |
| 1375 | 2226280.542 |
| 1376 | 2181754.931 |
| 1377 | 2225390.03 |
| 1378 | 2180882.229 |
| 1379 | 2224499.874 |
| 1380 | 2268989.871 |
| 1381 | 2223610.074 |
| 1382 | 2268082.275 |
| 1383 | 2222720.63 |
| 1384 | 2267175.042 |
| 1385 | 2312518.543 |
| 1386 | 2266268.172 |
| 1387 | 2220942.809 |
| 1388 | 2265361.665 |
| 1389 | 2220054.432 |
| 1390 | 2264455.52 |
| 1391 | 2309744.631 |
| 1392 | 2263549.738 |
| 1393 | 2308820.733 |
| 1394 | 2354997.147 |
| 1395 | 2307897.204 |
| 1396 | 2354055.149 |
| 1397 | 2401136.252 |
| 1398 | 2449158.977 |
| 1399 | 2498142.156 |
| 1400 | 2548104.999 |
| 1401 | 2599067.099 |
| 1402 | 2651048.441 |
| 1403 | 2598027.472 |
| 1404 | 2649988.022 |
| 1405 | 2702987.782 |
| 1406 | 2757047.538 |
| 1407 | 2701906.587 |
| 1408 | 2647868.455 |
| 1409 | 2594911.086 |
| 1410 | 2543012.865 |
| 1411 | 2593873.122 |
| 1412 | 2541995.659 |
| 1413 | 2592835.573 |
| 1414 | 2644692.284 |
| 1415 | 2697586.13 |
| 1416 | 2751537.852 |
| 1417 | 2806568.609 |
| 1418 | 2862699.982 |
| 1419 | 2919953.981 |
| 1420 | 2978353.061 |
| 1421 | 2918786 |
| 1422 | 2977161.72 |
| 1423 | 3036704.954 |
| 1424 | 3097439.053 |
| 1425 | 3035490.272 |
| 1426 | 3096200.077 |
| 1427 | 3034276.076 |
| 1428 | 2973590.554 |
| 1429 | 3033062.365 |
| 1430 | 2972401.118 |
| 1431 | 3031849.141 |
| 1432 | 3092486.123 |
| 1433 | 3030636.401 |
| 1434 | 3091249.129 |
| 1435 | 3153074.111 |
| 1436 | 3216135.594 |
| 1437 | 3280458.306 |
| 1438 | 3214849.139 |
| 1439 | 3150552.157 |
| 1440 | 3087541.114 |
| 1441 | 3149291.936 |
| 1442 | 3212277.775 |
| 1443 | 3148032.219 |
| 1444 | 3210992.863 |
| 1445 | 3275212.721 |
| 1446 | 3340716.975 |
| 1447 | 3407531.315 |
| 1448 | 3475681.941 |
| 1449 | 3545195.58 |
| 1450 | 3616099.491 |
| 1451 | 3543777.502 |
| 1452 | 3614653.052 |
| 1453 | 3542359.991 |
| 1454 | 3471512.791 |
| 1455 | 3540943.047 |
| 1456 | 3470124.186 |
| 1457 | 3539526.669 |
| 1458 | 3610317.203 |
| 1459 | 3538110.859 |
| 1460 | 3608873.076 |
| 1461 | 3536695.614 |
| 1462 | 3465961.702 |
| 1463 | 3535280.936 |
| 1464 | 3605986.555 |
| 1465 | 3533866.824 |
| 1466 | 3604544.16 |
| 1467 | 3676635.043 |
| 1468 | 3750167.744 |
| 1469 | 3675164.389 |
| 1470 | 3601661.102 |
| 1471 | 3673694.324 |
| 1472 | 3747168.21 |
| 1473 | 3672224.846 |
| 1474 | 3745669.343 |
| 1475 | 3670755.956 |
| 1476 | 3597340.837 |
| 1477 | 3669287.654 |
| 1478 | 3742673.407 |
| 1479 | 3817526.875 |
| 1480 | 3893877.412 |
| 1481 | 3815999.864 |
| 1482 | 3892319.861 |
| 1483 | 3814473.464 |
| 1484 | 3890762.933 |
| 1485 | 3968578.192 |
| 1486 | 3889206.628 |
| 1487 | 3811422.496 |
| 1488 | 3887650.945 |
| 1489 | 3965403.964 |
| 1490 | 4044712.044 |
| 1491 | 4125606.285 |
| 1492 | 4208118.41 |
| 1493 | 4123956.042 |
| 1494 | 4206435.163 |
| 1495 | 4290563.866 |
| 1496 | 4376375.143 |
| 1497 | 4463902.646 |
| 1498 | 4553180.699 |
| 1499 | 4462117.085 |
| 1500 | 4551359.427 |
| 1501 | 4642386.616 |
| 1502 | 4735234.348 |
| 1503 | 4640529.661 |
| 1504 | 4547719.068 |
| 1505 | 4456764.686 |
| 1506 | 4545899.98 |
| 1507 | 4636817.98 |
| 1508 | 4729554.339 |
| 1509 | 4824145.426 |
| 1510 | 4727662.517 |
| 1511 | 4822215.768 |
| 1512 | 4725771.452 |
| 1513 | 4631256.023 |
| 1514 | 4538630.903 |
| 1515 | 4629403.521 |
| 1516 | 4721991.591 |
| 1517 | 4816431.423 |
| 1518 | 4912760.052 |
| 1519 | 4814504.851 |
| 1520 | 4910794.948 |
| 1521 | 4812579.049 |
| 1522 | 4716327.468 |
| 1523 | 4622000.918 |
| 1524 | 4714440.937 |
| 1525 | 4808729.756 |
| 1526 | 4904904.351 |
| 1527 | 4806806.264 |
| 1528 | 4902942.389 |
| 1529 | 4804883.541 |
| 1530 | 4900981.212 |
| 1531 | 4999000.836 |
| 1532 | 4899020.819 |
| 1533 | 4801040.403 |
| 1534 | 4897061.211 |
| 1535 | 4995002.435 |
| 1536 | 4895102.387 |
| 1537 | 4797200.339 |
| 1538 | 4701256.332 |
| 1539 | 4795281.459 |
| 1540 | 4891187.088 |
| 1541 | 4989010.83 |
| 1542 | 5088791.046 |
| 1543 | 5190566.867 |
| 1544 | 5086755.53 |
| 1545 | 4985020.419 |
| 1546 | 4885320.011 |
| 1547 | 4787613.611 |
| 1548 | 4883365.883 |
| 1549 | 4785698.565 |
| 1550 | 4881412.537 |
| 1551 | 4979040.787 |
| 1552 | 5078621.603 |
| 1553 | 4977049.171 |
| 1554 | 4877508.188 |
| 1555 | 4779958.024 |
| 1556 | 4875557.184 |
| 1557 | 4778046.041 |
| 1558 | 4873606.961 |
| 1559 | 4971079.101 |
| 1560 | 5070500.683 |
| 1561 | 4969090.669 |
| 1562 | 5068472.482 |
| 1563 | 4967103.033 |
| 1564 | 5066445.093 |
| 1565 | 4965116.191 |
| 1566 | 4865813.868 |
| 1567 | 4768497.59 |
| 1568 | 4863867.542 |
| 1569 | 4766590.191 |
| 1570 | 4861921.995 |
| 1571 | 4764683.555 |
| 1572 | 4859977.226 |
| 1573 | 4957176.771 |
| 1574 | 5056320.306 |
| 1575 | 5157446.712 |
| 1576 | 5054297.778 |
| 1577 | 4953211.823 |
| 1578 | 4854147.586 |
| 1579 | 4951230.538 |
| 1580 | 4852205.927 |
| 1581 | 4755161.809 |
| 1582 | 4850265.045 |
| 1583 | 4753259.744 |
| 1584 | 4848324.939 |
| 1585 | 4945291.437 |
| 1586 | 5044197.266 |
| 1587 | 5145081.212 |
| 1588 | 5042179.587 |
| 1589 | 5143023.179 |
| 1590 | 5245883.643 |
| 1591 | 5140965.97 |
| 1592 | 5243785.289 |
| 1593 | 5348660.995 |
| 1594 | 5455634.215 |
| 1595 | 5564746.899 |
| 1596 | 5676041.837 |
| 1597 | 5789562.674 |
| 1598 | 5905353.927 |
| 1599 | 6023461.006 |
| 1600 | 6143930.226 |
| 1601 | 6021051.621 |
| 1602 | 6141472.654 |
| 1603 | 6018643.201 |
| 1604 | 6139016.065 |
| 1605 | 6261796.386 |
| 1606 | 6387032.314 |
| 1607 | 6514772.96 |
| 1608 | 6384477.501 |
| 1609 | 6512167.051 |
| 1610 | 6381923.71 |
| 1611 | 6254285.236 |
| 1612 | 6379370.94 |
| 1613 | 6506958.359 |
| 1614 | 6376819.192 |
| 1615 | 6504355.576 |
| 1616 | 6634442.687 |
| 1617 | 6501753.834 |
| 1618 | 6371718.757 |
| 1619 | 6499153.132 |
| 1620 | 6629136.195 |
| 1621 | 6761718.919 |
| 1622 | 6896953.297 |
| 1623 | 6759014.231 |
| 1624 | 6894194.516 |
| 1625 | 6756310.625 |
| 1626 | 6621184.413 |
| 1627 | 6488760.725 |
| 1628 | 6358985.51 |
| 1629 | 6231805.8 |
| 1630 | 6356441.916 |
| 1631 | 6483570.754 |
| 1632 | 6353899.339 |
| 1633 | 6480977.326 |
| 1634 | 6610596.873 |
| 1635 | 6478384.935 |
| 1636 | 6607952.634 |
| 1637 | 6475793.581 |
| 1638 | 6346277.709 |
| 1639 | 6219352.155 |
| 1640 | 6343739.198 |
| 1641 | 6470613.982 |
| 1642 | 6600026.262 |
| 1643 | 6732026.787 |
| 1644 | 6866667.323 |
| 1645 | 7004000.669 |
| 1646 | 6863920.656 |
| 1647 | 7001199.069 |
| 1648 | 6861175.088 |
| 1649 | 6723951.586 |
| 1650 | 6589472.554 |
| 1651 | 6457683.103 |
| 1652 | 6586836.765 |
| 1653 | 6718573.501 |
| 1654 | 6852944.971 |
| 1655 | 6990003.87 |
| 1656 | 7129803.947 |
| 1657 | 6987207.868 |
| 1658 | 7126952.026 |
| 1659 | 7269491.066 |
| 1660 | 7414880.888 |
| 1661 | 7266583.27 |
| 1662 | 7411914.935 |
| 1663 | 7263676.637 |
| 1664 | 7118403.104 |
| 1665 | 6976035.042 |
| 1666 | 7115555.743 |
| 1667 | 7257866.858 |
| 1668 | 7403024.195 |
| 1669 | 7551084.679 |
| 1670 | 7702106.372 |
| 1671 | 7856148.5 |
| 1672 | 8013271.47 |
| 1673 | 8173536.899 |
| 1674 | 8010066.161 |
| 1675 | 8170267.484 |
| 1676 | 8333672.834 |
| 1677 | 8166999.377 |
| 1678 | 8003659.39 |
| 1679 | 8163732.577 |
| 1680 | 8000457.926 |
| 1681 | 8160467.084 |
| 1682 | 8323676.426 |
| 1683 | 8490149.955 |
| 1684 | 8659952.954 |
| 1685 | 8833152.013 |
| 1686 | 9009815.053 |
| 1687 | 9190011.354 |
| 1688 | 9006211.127 |
| 1689 | 8826086.904 |
| 1690 | 9002608.643 |
| 1691 | 9182660.815 |
| 1692 | 9366314.032 |
| 1693 | 9553640.312 |
| 1694 | 9744713.119 |
| 1695 | 9939607.381 |
| 1696 | 10138399.529 |
| 1697 | 9935631.538 |
| 1698 | 9736918.907 |
| 1699 | 9931657.285 |
| 1700 | 10130290.431 |
| 1701 | 10332896.24 |
| 1702 | 10539554.165 |
| 1703 | 10328763.081 |
| 1704 | 10535338.343 |
| 1705 | 10324631.576 |
| 1706 | 10531124.208 |
| 1707 | 10741746.692 |
| 1708 | 10956581.626 |
| 1709 | 10737449.993 |
| 1710 | 10522700.993 |
| 1711 | 10312246.973 |
| 1712 | 10518491.913 |
| 1713 | 10728861.751 |
| 1714 | 10514284.516 |
| 1715 | 10303998.826 |
| 1716 | 10097918.849 |
| 1717 | 9895960.472 |
| 1718 | 10093879.682 |
| 1719 | 9892002.088 |
| 1720 | 10089842.13 |
| 1721 | 10291638.972 |
| 1722 | 10497471.752 |
| 1723 | 10707421.187 |
| 1724 | 10493272.763 |
| 1725 | 10283407.308 |
| 1726 | 10489075.454 |
| 1727 | 10279293.945 |
| 1728 | 10484879.824 |
| 1729 | 10275182.227 |
| 1730 | 10480685.872 |
| 1731 | 10690299.589 |
| 1732 | 10904105.581 |
| 1733 | 11122187.693 |
| 1734 | 11344631.447 |
| 1735 | 11571524.076 |
| 1736 | 11802954.557 |
| 1737 | 11566895.466 |
| 1738 | 11798233.375 |
| 1739 | 11562268.708 |
| 1740 | 11793514.082 |
| 1741 | 12029384.363 |
| 1742 | 12269972.051 |
| 1743 | 12024572.61 |
| 1744 | 12265064.062 |
| 1745 | 12019762.781 |
| 1746 | 12260158.036 |
| 1747 | 12505361.197 |
| 1748 | 12255253.973 |
| 1749 | 12500359.053 |
| 1750 | 12250351.872 |
| 1751 | 12005344.834 |
| 1752 | 11765237.937 |
| 1753 | 12000542.696 |
| 1754 | 11760531.842 |
| 1755 | 11525321.205 |
| 1756 | 11755827.629 |
| 1757 | 11990944.182 |
| 1758 | 12230763.066 |
| 1759 | 11986147.804 |
| 1760 | 11746424.848 |
| 1761 | 11511496.351 |
| 1762 | 11741726.278 |
| 1763 | 11976560.804 |
| 1764 | 12216092.02 |
| 1765 | 11971770.18 |
| 1766 | 12211205.583 |
| 1767 | 12455429.695 |
| 1768 | 12704538.289 |
| 1769 | 12958629.055 |
| 1770 | 13217801.636 |
| 1771 | 13482157.668 |
| 1772 | 13212514.515 |
| 1773 | 13476764.805 |
| 1774 | 13746300.101 |
| 1775 | 14021226.103 |
| 1776 | 13740801.581 |
| 1777 | 14015617.613 |
| 1778 | 14295929.965 |
| 1779 | 14581848.565 |
| 1780 | 14290211.593 |
| 1781 | 14576015.825 |
| 1782 | 14284495.509 |
| 1783 | 13998805.598 |
| 1784 | 13718829.486 |
| 1785 | 13993206.076 |
| 1786 | 13713341.955 |
| 1787 | 13987608.794 |
| 1788 | 14267360.97 |
| 1789 | 13982013.75 |
| 1790 | 14261654.025 |
| 1791 | 14546887.106 |
| 1792 | 14837824.848 |
| 1793 | 14541068.351 |
| 1794 | 14831889.718 |
| 1795 | 14535251.924 |
| 1796 | 14825956.962 |
| 1797 | 14529437.823 |
| 1798 | 14238849.066 |
| 1799 | 13954072.085 |
| 1800 | 14233153.527 |
| 1801 | 14517816.597 |
| 1802 | 14808172.929 |
| 1803 | 15104336.388 |
| 1804 | 14802249.66 |
| 1805 | 14506204.667 |
| 1806 | 14796328.76 |
| 1807 | 14500402.185 |
| 1808 | 14790410.229 |
| 1809 | 15086218.433 |
| 1810 | 15387942.802 |
| 1811 | 15080183.946 |
| 1812 | 15381787.625 |
| 1813 | 15074151.872 |
| 1814 | 15375634.91 |
| 1815 | 15068122.212 |
| 1816 | 14766759.767 |
| 1817 | 15062094.963 |
| 1818 | 14760853.063 |
| 1819 | 15056070.125 |
| 1820 | 15357191.527 |
| 1821 | 15050047.697 |
| 1822 | 15351048.651 |
| 1823 | 15658069.624 |
| 1824 | 15971231.016 |
| 1825 | 15651806.396 |
| 1826 | 15964842.524 |
| 1827 | 16284139.374 |
| 1828 | 15958456.587 |
| 1829 | 15639287.455 |
| 1830 | 15952073.204 |
| 1831 | 16271114.668 |
| 1832 | 15945692.375 |
| 1833 | 16264606.222 |
| 1834 | 16589898.347 |
| 1835 | 16921696.314 |
| 1836 | 17260130.24 |
| 1837 | 17605332.845 |
| 1838 | 17957439.502 |
| 1839 | 18316588.292 |
| 1840 | 18682920.057 |
| 1841 | 19056578.459 |
| 1842 | 18675446.889 |
| 1843 | 19048955.827 |
| 1844 | 19429934.944 |
| 1845 | 19818533.643 |
| 1846 | 19422162.97 |
| 1847 | 19810606.229 |
| 1848 | 19414394.105 |
| 1849 | 19802681.987 |
| 1850 | 20198735.626 |
| 1851 | 19794760.914 |
| 1852 | 20190656.132 |
| 1853 | 19786843.009 |
| 1854 | 20182579.87 |
| 1855 | 20586231.467 |
| 1856 | 20997956.096 |
| 1857 | 21417915.218 |
| 1858 | 21846273.523 |
| 1859 | 22283198.993 |
| 1860 | 21837535.013 |
| 1861 | 21400784.313 |
| 1862 | 20972768.627 |
| 1863 | 21392223.999 |
| 1864 | 21820068.479 |
| 1865 | 22256469.849 |
| 1866 | 22701599.246 |
| 1867 | 22247567.261 |
| 1868 | 22692518.606 |
| 1869 | 23146368.978 |
| 1870 | 22683441.599 |
| 1871 | 23137110.431 |
| 1872 | 23599852.639 |
| 1873 | 24071849.692 |
| 1874 | 24553286.686 |
| 1875 | 25044352.42 |
| 1876 | 25545239.468 |
| 1877 | 25034334.679 |
| 1878 | 24533647.985 |
| 1879 | 25024320.945 |
| 1880 | 25524807.364 |
| 1881 | 26035303.511 |
| 1882 | 26556009.581 |
| 1883 | 27087129.773 |
| 1884 | 26545387.177 |
| 1885 | 26014479.434 |
| 1886 | 25494189.845 |
| 1887 | 24984306.048 |
| 1888 | 25483992.169 |
| 1889 | 25993672.013 |
| 1890 | 26513545.453 |
| 1891 | 27043816.362 |
| 1892 | 26502940.035 |
| 1893 | 25972881.234 |
| 1894 | 25453423.609 |
| 1895 | 25962492.081 |
| 1896 | 25443242.24 |
| 1897 | 24934377.395 |
| 1898 | 25433064.943 |
| 1899 | 25941726.242 |
| 1900 | 26460560.767 |
| 1901 | 25931349.551 |
| 1902 | 26449976.542 |
| 1903 | 25920977.011 |
| 1904 | 26439396.552 |
| 1905 | 26968184.483 |
| 1906 | 27507548.172 |
| 1907 | 26957397.209 |
| 1908 | 26418249.265 |
| 1909 | 25889884.279 |
| 1910 | 26407681.965 |
| 1911 | 26935835.604 |
| 1912 | 27474552.316 |
| 1913 | 28024043.363 |
| 1914 | 27463562.496 |
| 1915 | 28012833.745 |
| 1916 | 27452577.071 |
| 1917 | 28001628.612 |
| 1918 | 27441596.04 |
| 1919 | 27990427.961 |
| 1920 | 28550236.52 |
| 1921 | 29121241.25 |
| 1922 | 28538816.425 |
| 1923 | 29109592.754 |
| 1924 | 29691784.609 |
| 1925 | 29097948.917 |
| 1926 | 29679907.895 |
| 1927 | 30273506.053 |
| 1928 | 29668035.932 |
| 1929 | 30261396.65 |
| 1930 | 30866624.583 |
| 1931 | 30249292.092 |
| 1932 | 30854277.933 |
| 1933 | 30237192.375 |
| 1934 | 30841936.222 |
| 1935 | 31458774.947 |
| 1936 | 32087950.446 |
| 1937 | 31446191.437 |
| 1938 | 30817267.608 |
| 1939 | 30200922.256 |
| 1940 | 29596903.811 |
| 1941 | 30188841.887 |
| 1942 | 29585065.049 |
| 1943 | 28993363.748 |
| 1944 | 29573231.023 |
| 1945 | 28981766.403 |
| 1946 | 28402131.075 |
| 1947 | 28970173.696 |
| 1948 | 28390770.222 |
| 1949 | 27822954.818 |
| 1950 | 28379413.914 |
| 1951 | 28947002.192 |
| 1952 | 29525942.236 |
| 1953 | 30116461.081 |
| 1954 | 30718790.303 |
| 1955 | 31333166.109 |
| 1956 | 30706502.787 |
| 1957 | 30092372.731 |
| 1958 | 29490525.276 |
| 1959 | 30080335.782 |
| 1960 | 30681942.497 |
| 1961 | 30068303.647 |
| 1962 | 30669669.72 |
| 1963 | 31283063.115 |
| 1964 | 30657401.852 |
| 1965 | 31270549.89 |
| 1966 | 30645138.892 |
| 1967 | 30032236.114 |
| 1968 | 30632880.836 |
| 1969 | 30020223.219 |
| 1970 | 30620627.684 |
| 1971 | 31233040.238 |
| 1972 | 31857701.042 |
| 1973 | 31220547.021 |
| 1974 | 30596136.081 |
| 1975 | 31208058.803 |
| 1976 | 31832219.979 |
| 1977 | 31195575.579 |
| 1978 | 30571664.068 |
| 1979 | 29960230.786 |
| 1980 | 30559435.402 |
| 1981 | 31170624.11 |
| 1982 | 31794036.592 |
| 1983 | 32429917.324 |
| 1984 | 31781318.977 |
| 1985 | 32416945.357 |
| 1986 | 31768606.45 |
| 1987 | 32403978.579 |
| 1988 | 31755899.007 |
| 1989 | 31120781.027 |
| 1990 | 30498365.407 |
| 1991 | 31108332.715 |
| 1992 | 31730499.369 |
| 1993 | 32365109.356 |
| 1994 | 33012411.544 |
| 1995 | 33672659.774 |
| 1996 | 32999206.579 |
| 1997 | 32339222.447 |
| 1998 | 32986006.896 |
| 1999 | 32326286.758 |
| 2000 | 32972812.494 |
| 2001 | 32313356.244 |
| 2002 | 31667089.119 |
| 2003 | 32300430.901 |
| 2004 | 31654422.283 |
| 2005 | 32287510.729 |
| 2006 | 32933260.943 |
| 2007 | 33591926.162 |
| 2008 | 32920087.639 |
| 2009 | 32261685.886 |
| 2010 | 32906919.604 |
| 2011 | 33565057.996 |
| 2012 | 32893756.836 |
| 2013 | 32235881.699 |
| 2014 | 32880599.333 |
| 2015 | 33538211.32 |
| 2016 | 34208975.546 |
| 2017 | 34893155.057 |
| 2018 | 35591018.159 |
| 2019 | 36302838.522 |
| 2020 | 37028895.292 |
| 2021 | 36288317.386 |
| 2022 | 35562551.039 |
| 2023 | 34851300.018 |
| 2024 | 35548326.018 |
| 2025 | 36259292.539 |
| 2026 | 35534106.688 |
| 2027 | 36244788.822 |
| 2028 | 35519893.045 |
| 2029 | 34809495.184 |
| 2030 | 35505685.088 |
| 2031 | 36215798.79 |
| 2032 | 35491482.814 |
| 2033 | 36201312.47 |
| 2034 | 36925338.72 |
| 2035 | 36186831.945 |
| 2036 | 36910568.584 |
| 2037 | 36172357.212 |
| 2038 | 36895804.357 |
| 2039 | 37633720.444 |
| 2040 | 38386394.853 |
| 2041 | 37618666.956 |
| 2042 | 38371040.295 |
| 2043 | 37603619.489 |
| 2044 | 38355691.879 |
| 2045 | 39122805.716 |
| 2046 | 38340349.602 |
| 2047 | 39107156.594 |
| 2048 | 39889299.726 |
| 2049 | 39091513.731 |
| 2050 | 39873344.006 |
| 2051 | 40670810.886 |
| 2052 | 41484227.104 |
| 2053 | 40654542.562 |
| 2054 | 41467633.413 |
| 2055 | 40638280.745 |
| 2056 | 41451046.359 |
| 2057 | 42280067.287 |
| 2058 | 43125668.632 |
| 2059 | 43988182.005 |
| 2060 | 44867945.645 |
| 2061 | 45765304.558 |
| 2062 | 46680610.649 |
| 2063 | 47614222.862 |
| 2064 | 48566507.319 |
| 2065 | 49537837.466 |
| 2066 | 48547080.716 |
| 2067 | 49518022.331 |
| 2068 | 50508382.777 |
| 2069 | 51518550.433 |
| 2070 | 50488179.424 |
| 2071 | 51497943.013 |
| 2072 | 50467984.153 |
| 2073 | 49458624.469 |
| 2074 | 48469451.98 |
| 2075 | 49438841.02 |
| 2076 | 50427617.84 |
| 2077 | 49419065.483 |
| 2078 | 48430684.174 |
| 2079 | 49399297.857 |
| 2080 | 50387283.814 |
| 2081 | 51395029.491 |
| 2082 | 52422930.08 |
| 2083 | 53471388.682 |
| 2084 | 52401960.908 |
| 2085 | 53450000.126 |
| 2086 | 52381000.124 |
| 2087 | 51333380.121 |
| 2088 | 50306712.519 |
| 2089 | 51312846.769 |
| 2090 | 52339103.705 |
| 2091 | 53385885.779 |
| 2092 | 54453603.494 |
| 2093 | 53364531.425 |
| 2094 | 52297240.796 |
| 2095 | 51251295.98 |
| 2096 | 52276321.9 |
| 2097 | 53321848.338 |
| 2098 | 54388285.305 |
| 2099 | 53300519.598 |
| 2100 | 52234509.206 |
| 2101 | 53279199.391 |
| 2102 | 54344783.378 |
| 2103 | 55431679.046 |
| 2104 | 56540312.627 |
| 2105 | 55409506.374 |
| 2106 | 56517696.502 |
| 2107 | 57648050.432 |
| 2108 | 58801011.441 |
| 2109 | 57624991.212 |
| 2110 | 58777491.036 |
| 2111 | 59953040.857 |
| 2112 | 61152101.674 |
| 2113 | 62375143.707 |
| 2114 | 61127640.833 |
| 2115 | 59905088.016 |
| 2116 | 61103189.777 |
| 2117 | 62325253.572 |
| 2118 | 61078748.501 |
| 2119 | 62300323.471 |
| 2120 | 63546329.94 |
| 2121 | 64817256.539 |
| 2122 | 66113601.67 |
| 2123 | 67435873.703 |
| 2124 | 68784591.177 |
| 2125 | 70160283.001 |
| 2126 | 71563488.661 |
| 2127 | 72994758.434 |
| 2128 | 74454653.603 |
| 2129 | 72965560.531 |
| 2130 | 74424871.741 |
| 2131 | 72936374.307 |
| 2132 | 71477646.82 |
| 2133 | 70048093.884 |
| 2134 | 68647132.006 |
| 2135 | 70020074.646 |
| 2136 | 71420476.139 |
| 2137 | 72848885.662 |
| 2138 | 74305863.375 |
| 2139 | 75791980.643 |
| 2140 | 77307820.256 |
| 2141 | 78853976.661 |
| 2142 | 77276897.128 |
| 2143 | 75731359.185 |
| 2144 | 74216732.001 |
| 2145 | 72732397.361 |
| 2146 | 74187045.309 |
| 2147 | 72703304.402 |
| 2148 | 74157370.49 |
| 2149 | 75640517.9 |
| 2150 | 77153328.258 |
| 2151 | 75610261.693 |
| 2152 | 74098056.459 |
| 2153 | 75580017.588 |
| 2154 | 77091617.94 |
| 2155 | 78633450.299 |
| 2156 | 80206119.305 |
| 2157 | 81810241.691 |
| 2158 | 83446446.525 |
| 2159 | 85115375.455 |
| 2160 | 83413067.946 |
| 2161 | 85081329.305 |
| 2162 | 86782955.891 |
| 2163 | 85047296.774 |
| 2164 | 83346350.838 |
| 2165 | 85013277.855 |
| 2166 | 86713543.412 |
| 2167 | 88447814.28 |
| 2168 | 90216770.566 |
| 2169 | 88412435.154 |
| 2170 | 90180683.858 |
| 2171 | 91984297.535 |
| 2172 | 90144611.584 |
| 2173 | 88341719.352 |
| 2174 | 90108553.739 |
| 2175 | 91910724.814 |
| 2176 | 93748939.31 |
| 2177 | 95623918.097 |
| 2178 | 97536396.459 |
| 2179 | 99487124.388 |
| 2180 | 101476866.876 |
| 2181 | 99447329.538 |
| 2182 | 101436276.129 |
| 2183 | 103465001.651 |
| 2184 | 101395701.618 |
| 2185 | 103423615.651 |
| 2186 | 105492087.964 |
| 2187 | 107601929.723 |
| 2188 | 109753968.317 |
| 2189 | 107558888.951 |
| 2190 | 109710066.73 |
| 2191 | 111904268.065 |
| 2192 | 109666182.703 |
| 2193 | 107472859.049 |
| 2194 | 105323401.868 |
| 2195 | 103216933.831 |
| 2196 | 105281272.508 |
| 2197 | 103175647.057 |
| 2198 | 105239159.999 |
| 2199 | 107343943.199 |
| 2200 | 109490822.063 |
| 2201 | 111680638.504 |
| 2202 | 113914251.274 |
| 2203 | 111635966.248 |
| 2204 | 113868685.573 |
| 2205 | 116146059.285 |
| 2206 | 118468980.471 |
| 2207 | 120838360.08 |
| 2208 | 123255127.282 |
| 2209 | 125720229.827 |
| 2210 | 128234634.424 |
| 2211 | 125669941.735 |
| 2212 | 128183340.57 |
| 2213 | 130747007.381 |
| 2214 | 128132067.234 |
| 2215 | 130694708.578 |
| 2216 | 133308602.75 |
| 2217 | 135974774.805 |
| 2218 | 138694270.301 |
| 2219 | 135920384.895 |
| 2220 | 133201977.197 |
| 2221 | 135866016.741 |
| 2222 | 138583337.076 |
| 2223 | 141355003.817 |
| 2224 | 138527903.741 |
| 2225 | 141298461.816 |
| 2226 | 138472492.58 |
| 2227 | 141241942.431 |
| 2228 | 138417103.583 |
| 2229 | 141185445.654 |
| 2230 | 144009154.567 |
| 2231 | 146889337.659 |
| 2232 | 149827124.412 |
| 2233 | 152823666.9 |
| 2234 | 155880140.238 |
| 2235 | 158997743.043 |
| 2236 | 162177697.904 |
| 2237 | 158934143.946 |
| 2238 | 155755461.067 |
| 2239 | 158870570.288 |
| 2240 | 162047981.694 |
| 2241 | 158807022.06 |
| 2242 | 161983162.501 |
| 2243 | 158743499.251 |
| 2244 | 161918369.236 |
| 2245 | 158680001.851 |
| 2246 | 155506401.814 |
| 2247 | 152396273.778 |
| 2248 | 155444199.254 |
| 2249 | 152335315.269 |
| 2250 | 155382021.574 |
| 2251 | 158489662.005 |
| 2252 | 161659455.245 |
| 2253 | 158426266.141 |
| 2254 | 155257740.818 |
| 2255 | 158362895.634 |
| 2256 | 161530153.547 |
| 2257 | 164760756.618 |
| 2258 | 161465541.485 |
| 2259 | 158236230.656 |
| 2260 | 155071506.043 |
| 2261 | 158172936.163 |
| 2262 | 161336394.887 |
| 2263 | 164563122.784 |
| 2264 | 161271860.329 |
| 2265 | 158046423.122 |
| 2266 | 161207351.585 |
| 2267 | 164431498.616 |
| 2268 | 161142868.644 |
| 2269 | 157920011.271 |
| 2270 | 161078411.496 |
| 2271 | 164299979.726 |
| 2272 | 161013980.132 |
| 2273 | 164234259.735 |
| 2274 | 167518944.929 |
| 2275 | 164168566.031 |
| 2276 | 160885194.71 |
| 2277 | 164102898.604 |
| 2278 | 167384956.576 |
| 2279 | 170732655.708 |
| 2280 | 167318002.594 |
| 2281 | 170664362.646 |
| 2282 | 174077649.898 |
| 2283 | 170596096.9 |
| 2284 | 167184174.962 |
| 2285 | 170527858.462 |
| 2286 | 173938415.631 |
| 2287 | 170459647.318 |
| 2288 | 167050454.372 |
| 2289 | 163709445.285 |
| 2290 | 166983634.19 |
| 2291 | 170323306.874 |
| 2292 | 173729773.012 |
| 2293 | 177204368.472 |
| 2294 | 180748455.841 |
| 2295 | 177133486.724 |
| 2296 | 180676156.459 |
| 2297 | 184289679.588 |
| 2298 | 187975473.18 |
| 2299 | 191734982.643 |
| 2300 | 195569682.296 |
| 2301 | 199481075.942 |
| 2302 | 195491454.423 |
| 2303 | 199401283.512 |
| 2304 | 203389309.182 |
| 2305 | 199321522.998 |
| 2306 | 203307953.458 |
| 2307 | 199241794.389 |
| 2308 | 203226630.277 |
| 2309 | 199162097.671 |
| 2310 | 203145339.625 |
| 2311 | 207208246.417 |
| 2312 | 211352411.346 |
| 2313 | 215579459.573 |
| 2314 | 219891048.764 |
| 2315 | 224288869.739 |
| 2316 | 219803092.345 |
| 2317 | 224199154.191 |
| 2318 | 219715171.108 |
| 2319 | 215320867.685 |
| 2320 | 219627285.039 |
| 2321 | 224019830.74 |
| 2322 | 228500227.355 |
| 2323 | 233070231.902 |
| 2324 | 237731636.54 |
| 2325 | 232977003.809 |
| 2326 | 228317463.733 |
| 2327 | 223751114.458 |
| 2328 | 228226136.747 |
| 2329 | 223661614.012 |
| 2330 | 228134846.293 |
| 2331 | 223572149.367 |
| 2332 | 228043592.354 |
| 2333 | 232604464.201 |
| 2334 | 237256553.485 |
| 2335 | 242001684.555 |
| 2336 | 237161650.864 |
| 2337 | 232418417.847 |
| 2338 | 237066786.204 |
| 2339 | 241808121.928 |
| 2340 | 246644284.366 |
| 2341 | 251577170.054 |
| 2342 | 246545626.652 |
| 2343 | 251476539.186 |
| 2344 | 246447008.402 |
| 2345 | 251375948.57 |
| 2346 | 246348429.598 |
| 2347 | 241421461.006 |
| 2348 | 236593031.786 |
| 2349 | 241324892.422 |
| 2350 | 236498394.574 |
| 2351 | 231768426.682 |
| 2352 | 227133058.149 |
| 2353 | 222590396.986 |
| 2354 | 227042204.925 |
| 2355 | 222501360.827 |
| 2356 | 226951388.043 |
| 2357 | 222412360.282 |
| 2358 | 226860607.488 |
| 2359 | 231397819.638 |
| 2360 | 236025776.031 |
| 2361 | 231305260.51 |
| 2362 | 235931365.72 |
| 2363 | 231212738.406 |
| 2364 | 235836993.174 |
| 2365 | 231120253.31 |
| 2366 | 235742658.377 |
| 2367 | 231027805.209 |
| 2368 | 235648361.313 |
| 2369 | 230935394.087 |
| 2370 | 235554101.969 |
| 2371 | 240265184.008 |
| 2372 | 245070487.688 |
| 2373 | 249971897.442 |
| 2374 | 254971335.391 |
| 2375 | 249871908.683 |
| 2376 | 244874470.509 |
| 2377 | 239976981.099 |
| 2378 | 244776520.721 |
| 2379 | 239880990.307 |
| 2380 | 244678610.113 |
| 2381 | 249572182.315 |
| 2382 | 254563625.961 |
| 2383 | 249472353.442 |
| 2384 | 254461800.511 |
| 2385 | 259551036.521 |
| 2386 | 264742057.252 |
| 2387 | 259447216.107 |
| 2388 | 264636160.429 |
| 2389 | 269928883.637 |
| 2390 | 275327461.31 |
| 2391 | 269820912.084 |
| 2392 | 264424493.842 |
| 2393 | 269712983.719 |
| 2394 | 264318724.045 |
| 2395 | 259032349.564 |
| 2396 | 264212996.555 |
| 2397 | 258928736.624 |
| 2398 | 253750161.892 |
| 2399 | 248675158.654 |
| 2400 | 243701655.481 |
| 2401 | 248575688.59 |
| 2402 | 253547202.362 |
| 2403 | 258618146.409 |
| 2404 | 253445783.481 |
| 2405 | 258514699.151 |
| 2406 | 263684993.134 |
| 2407 | 268958692.996 |
| 2408 | 263579519.136 |
| 2409 | 268851109.519 |
| 2410 | 274228131.71 |
| 2411 | 268743569.075 |
| 2412 | 274118440.457 |
| 2413 | 279600809.266 |
| 2414 | 285192825.451 |
| 2415 | 290896681.96 |
| 2416 | 296714615.6 |
| 2417 | 290780323.288 |
| 2418 | 296595929.753 |
| 2419 | 302527848.348 |
| 2420 | 308578405.315 |
| 2421 | 314749973.422 |
| 2422 | 308454973.953 |
| 2423 | 302285874.474 |
| 2424 | 308331591.964 |
| 2425 | 302164960.124 |
| 2426 | 308208259.327 |
| 2427 | 302044094.14 |
| 2428 | 296003212.258 |
| 2429 | 301923276.503 |
| 2430 | 307961742.033 |
| 2431 | 301802507.192 |
| 2432 | 307838557.336 |
| 2433 | 301681786.189 |
| 2434 | 307715421.913 |
| 2435 | 313869730.351 |
| 2436 | 320147124.958 |
| 2437 | 313744182.459 |
| 2438 | 307469298.81 |
| 2439 | 301319912.834 |
| 2440 | 307346311.09 |
| 2441 | 313493237.312 |
| 2442 | 319763102.059 |
| 2443 | 313367840.017 |
| 2444 | 307100483.217 |
| 2445 | 313242492.881 |
| 2446 | 306977643.024 |
| 2447 | 313117195.884 |
| 2448 | 306854851.966 |
| 2449 | 300717754.927 |
| 2450 | 294703399.829 |
| 2451 | 288809331.832 |
| 2452 | 294585518.469 |
| 2453 | 300477228.838 |
| 2454 | 294467684.261 |
| 2455 | 300357037.947 |
| 2456 | 294349897.188 |
| 2457 | 300236895.131 |
| 2458 | 294232157.229 |
| 2459 | 300116800.373 |
| 2460 | 294114464.366 |
| 2461 | 299996753.653 |
| 2462 | 293996818.58 |
| 2463 | 299876754.952 |
| 2464 | 305874290.051 |
| 2465 | 299756804.25 |
| 2466 | 293761668.165 |
| 2467 | 287886434.801 |
| 2468 | 293644163.497 |
| 2469 | 287771280.227 |
| 2470 | 293526705.832 |
| 2471 | 299397239.949 |
| 2472 | 293409295.15 |
| 2473 | 299277481.053 |
| 2474 | 305263030.674 |
| 2475 | 299157770.06 |
| 2476 | 293174614.659 |
| 2477 | 287311122.366 |
| 2478 | 281564899.919 |
| 2479 | 275933601.92 |
| 2480 | 281452273.959 |
| 2481 | 287081319.438 |
| 2482 | 281339693.049 |
| 2483 | 286966486.91 |
| 2484 | 292705816.648 |
| 2485 | 298559932.981 |
| 2486 | 292588734.322 |
| 2487 | 298440509.008 |
| 2488 | 292471698.828 |
| 2489 | 298321132.804 |
| 2490 | 292354710.148 |
| 2491 | 286507615.945 |
| 2492 | 292237768.264 |
| 2493 | 286393012.899 |
| 2494 | 280665152.641 |
| 2495 | 286278455.694 |
| 2496 | 280552886.58 |
| 2497 | 274941828.848 |
| 2498 | 280440665.425 |
| 2499 | 286049478.734 |
| 2500 | 291770468.308 |
| 2501 | 285935058.942 |
| 2502 | 280216357.763 |
| 2503 | 285820684.919 |
| 2504 | 280104271.22 |
| 2505 | 285706356.645 |
| 2506 | 291420483.778 |
| 2507 | 285592074.102 |
| 2508 | 279880232.62 |
| 2509 | 285477837.272 |
| 2510 | 279768280.527 |
| 2511 | 285363646.138 |
| 2512 | 279656373.215 |
| 2513 | 274063245.75 |
| 2514 | 279544510.666 |
| 2515 | 285135400.879 |
| 2516 | 290838108.896 |
| 2517 | 296654871.074 |
| 2518 | 302587968.496 |
| 2519 | 308639727.866 |
| 2520 | 314812522.423 |
| 2521 | 321108772.871 |
| 2522 | 327530948.329 |
| 2523 | 320980329.362 |
| 2524 | 327399935.95 |
| 2525 | 333947934.669 |
| 2526 | 340626893.362 |
| 2527 | 333814355.495 |
| 2528 | 340490642.605 |
| 2529 | 347300455.457 |
| 2530 | 340354446.348 |
| 2531 | 333547357.421 |
| 2532 | 340218304.569 |
| 2533 | 333413938.478 |
| 2534 | 340082217.247 |
| 2535 | 346883861.592 |
| 2536 | 353821538.824 |
| 2537 | 360897969.6 |
| 2538 | 368115928.992 |
| 2539 | 375478247.572 |
| 2540 | 382987812.524 |
| 2541 | 375328056.273 |
| 2542 | 382834617.399 |
| 2543 | 390491309.747 |
| 2544 | 382681483.552 |
| 2545 | 390335113.223 |
| 2546 | 398141815.487 |
| 2547 | 390178979.178 |
| 2548 | 397982558.761 |
| 2549 | 405942209.936 |
| 2550 | 414061054.135 |
| 2551 | 422342275.218 |
| 2552 | 430789120.722 |
| 2553 | 439404903.137 |
| 2554 | 448193001.199 |
| 2555 | 457156861.223 |
| 2556 | 448013723.999 |
| 2557 | 439053449.519 |
| 2558 | 430272380.528 |
| 2559 | 438877828.139 |
| 2560 | 430100271.576 |
| 2561 | 438702277.008 |
| 2562 | 447476322.548 |
| 2563 | 456425848.999 |
| 2564 | 447297332.019 |
| 2565 | 438351385.379 |
| 2566 | 447118413.086 |
| 2567 | 438176044.824 |
| 2568 | 429412523.928 |
| 2569 | 438000774.406 |
| 2570 | 446760789.895 |
| 2571 | 455696005.692 |
| 2572 | 464809925.806 |
| 2573 | 474106124.322 |
| 2574 | 464624001.836 |
| 2575 | 473916481.873 |
| 2576 | 483394811.51 |
| 2577 | 493062707.74 |
| 2578 | 483201453.586 |
| 2579 | 492865482.657 |
| 2580 | 483008173.004 |
| 2581 | 473348009.544 |
| 2582 | 463881049.353 |
| 2583 | 473158670.34 |
| 2584 | 463695496.933 |
| 2585 | 454421586.995 |
| 2586 | 463510018.735 |
| 2587 | 472780219.109 |
| 2588 | 482235823.492 |
| 2589 | 491880539.961 |
| 2590 | 501718150.761 |
| 2591 | 491683787.745 |
| 2592 | 481850111.99 |
| 2593 | 491487114.23 |
| 2594 | 501316856.515 |
| 2595 | 511343193.645 |
| 2596 | 501116329.772 |
| 2597 | 491094003.177 |
| 2598 | 481272123.113 |
| 2599 | 490897565.576 |
| 2600 | 481079614.264 |
| 2601 | 490701206.549 |
| 2602 | 480887182.418 |
| 2603 | 490504926.067 |
| 2604 | 500315024.588 |
| 2605 | 490308724.096 |
| 2606 | 480502549.614 |
| 2607 | 490112600.607 |
| 2608 | 499914852.619 |
| 2609 | 509913149.671 |
| 2610 | 520111412.665 |
| 2611 | 509709184.411 |
| 2612 | 519903368.1 |
| 2613 | 530301435.461 |
| 2614 | 540907464.171 |
| 2615 | 530089314.887 |
| 2616 | 540691101.185 |
| 2617 | 529877279.161 |
| 2618 | 540474824.745 |
| 2619 | 551284321.239 |
| 2620 | 540258634.815 |
| 2621 | 529453462.118 |
| 2622 | 518864392.876 |
| 2623 | 508487105.019 |
| 2624 | 498317362.918 |
| 2625 | 508283710.176 |
| 2626 | 498118035.973 |
| 2627 | 488155675.254 |
| 2628 | 497918788.759 |
| 2629 | 507877164.534 |
| 2630 | 518034707.824 |
| 2631 | 507674013.668 |
| 2632 | 497520533.395 |
| 2633 | 507470944.062 |
| 2634 | 517620362.944 |
| 2635 | 507267955.685 |
| 2636 | 497122596.571 |
| 2637 | 507065048.503 |
| 2638 | 496923747.533 |
| 2639 | 506862222.483 |
| 2640 | 496724978.034 |
| 2641 | 486790478.473 |
| 2642 | 496526288.042 |
| 2643 | 506456813.803 |
| 2644 | 496327677.527 |
| 2645 | 486401123.977 |
| 2646 | 476673101.497 |
| 2647 | 467139639.467 |
| 2648 | 476482432.256 |
| 2649 | 466952783.611 |
| 2650 | 457613727.939 |
| 2651 | 448461453.38 |
| 2652 | 439492224.313 |
| 2653 | 448282068.799 |
| 2654 | 439316427.423 |
| 2655 | 448102755.971 |
| 2656 | 439140700.852 |
| 2657 | 447923514.869 |
| 2658 | 438965044.572 |
| 2659 | 430185743.68 |
| 2660 | 438789458.554 |
| 2661 | 447565247.725 |
| 2662 | 438613942.77 |
| 2663 | 447386221.626 |
| 2664 | 456333946.058 |
| 2665 | 465460624.979 |
| 2666 | 456151412.48 |
| 2667 | 465274440.729 |
| 2668 | 474579929.544 |
| 2669 | 465088330.953 |
| 2670 | 474390097.572 |
| 2671 | 464902295.621 |
| 2672 | 474200341.533 |
| 2673 | 464716334.703 |
| 2674 | 455422008.009 |
| 2675 | 464530448.169 |
| 2676 | 473821057.132 |
| 2677 | 483297478.275 |
| 2678 | 492963427.84 |
| 2679 | 502822696.397 |
| 2680 | 512879150.325 |
| 2681 | 502621567.318 |
| 2682 | 512673998.665 |
| 2683 | 522927478.638 |
| 2684 | 533386028.211 |
| 2685 | 544053748.775 |
| 2686 | 533172673.8 |
| 2687 | 543836127.276 |
| 2688 | 554712849.821 |
| 2689 | 543618592.825 |
| 2690 | 532746220.968 |
| 2691 | 543401145.388 |
| 2692 | 532533122.48 |
| 2693 | 543183784.929 |
| 2694 | 554047460.628 |
| 2695 | 565128409.841 |
| 2696 | 576430978.037 |
| 2697 | 587959597.598 |
| 2698 | 576200405.646 |
| 2699 | 587724413.759 |
| 2700 | 575969925.484 |
| 2701 | 564450526.974 |
| 2702 | 575739537.514 |
| 2703 | 587254328.264 |
| 2704 | 598999414.829 |
| 2705 | 610979403.126 |
| 2706 | 623198991.188 |
| 2707 | 635662971.012 |
| 2708 | 648376230.432 |
| 2709 | 661343755.041 |
| 2710 | 674570630.142 |
| 2711 | 688062042.745 |
| 2712 | 701823283.6 |
| 2713 | 715859749.271 |
| 2714 | 701542554.286 |
| 2715 | 687511703.2 |
| 2716 | 701261937.264 |
| 2717 | 687236698.519 |
| 2718 | 700981432.489 |
| 2719 | 715001061.139 |
| 2720 | 700701039.916 |
| 2721 | 686687019.118 |
| 2722 | 672953278.736 |
| 2723 | 686412344.31 |
| 2724 | 700140591.197 |
| 2725 | 686137779.373 |
| 2726 | 699860534.96 |
| 2727 | 685863324.261 |
| 2728 | 699580590.746 |
| 2729 | 713572202.561 |
| 2730 | 727843646.612 |
| 2731 | 713286773.68 |
| 2732 | 699021038.207 |
| 2733 | 713001458.971 |
| 2734 | 727261488.15 |
| 2735 | 741806717.913 |
| 2736 | 726970583.555 |
| 2737 | 712431171.884 |
| 2738 | 726679795.321 |
| 2739 | 741213391.228 |
| 2740 | 756037659.052 |
| 2741 | 771158412.233 |
| 2742 | 786581580.478 |
| 2743 | 802313212.088 |
| 2744 | 818359476.329 |
| 2745 | 801992286.803 |
| 2746 | 785952441.067 |
| 2747 | 801671489.888 |
| 2748 | 817704919.686 |
| 2749 | 801350821.292 |
| 2750 | 785323804.866 |
| 2751 | 801030280.964 |
| 2752 | 785009675.344 |
| 2753 | 800709868.851 |
| 2754 | 784695671.474 |
| 2755 | 800389584.904 |
| 2756 | 784381793.206 |
| 2757 | 800069429.07 |
| 2758 | 816070817.651 |
| 2759 | 832392234.004 |
| 2760 | 815744389.324 |
| 2761 | 799429501.538 |
| 2762 | 815418091.568 |
| 2763 | 831726453.4 |
| 2764 | 815091924.332 |
| 2765 | 798790085.845 |
| 2766 | 782814284.128 |
| 2767 | 798470569.811 |
| 2768 | 814439981.207 |
| 2769 | 830728780.831 |
| 2770 | 814114205.214 |
| 2771 | 830396489.319 |
| 2772 | 847004419.105 |
| 2773 | 830064330.723 |
| 2774 | 846665617.337 |
| 2775 | 863598929.684 |
| 2776 | 880870908.278 |
| 2777 | 898488326.443 |
| 2778 | 880518559.915 |
| 2779 | 862908188.716 |
| 2780 | 845650024.942 |
| 2781 | 828737024.443 |
| 2782 | 845311764.932 |
| 2783 | 862218000.231 |
| 2784 | 879462360.235 |
| 2785 | 897051607.44 |
| 2786 | 879110575.291 |
| 2787 | 861528363.785 |
| 2788 | 844297796.51 |
| 2789 | 827411840.579 |
| 2790 | 810863603.768 |
| 2791 | 827080875.843 |
| 2792 | 810539258.326 |
| 2793 | 826750043.493 |
| 2794 | 843285044.363 |
| 2795 | 860150745.25 |
| 2796 | 842947730.345 |
| 2797 | 826088775.738 |
| 2798 | 842610551.253 |
| 2799 | 859462762.278 |
| 2800 | 842273507.032 |
| 2801 | 859118977.173 |
| 2802 | 876301356.716 |
| 2803 | 858775329.582 |
| 2804 | 875950836.174 |
| 2805 | 893469852.897 |
| 2806 | 911339249.955 |
| 2807 | 929566034.954 |
| 2808 | 910974714.255 |
| 2809 | 892755219.97 |
| 2810 | 874900115.571 |
| 2811 | 892398117.882 |
| 2812 | 874550155.524 |
| 2813 | 892041158.635 |
| 2814 | 909881981.808 |
| 2815 | 928079621.444 |
| 2816 | 909518029.015 |
| 2817 | 927708389.595 |
| 2818 | 946262557.387 |
| 2819 | 965187808.535 |
| 2820 | 984491564.706 |
| 2821 | 1004181396 |
| 2822 | 1024265023.92 |
| 2823 | 1044750324.398 |
| 2824 | 1023855317.91 |
| 2825 | 1003378211.552 |
| 2826 | 983310647.321 |
| 2827 | 1002976860.267 |
| 2828 | 982917323.062 |
| 2829 | 1002575669.523 |
| 2830 | 1022627182.914 |
| 2831 | 1043079726.572 |
| 2832 | 1063941321.103 |
| 2833 | 1042662494.681 |
| 2834 | 1063515744.575 |
| 2835 | 1042245429.683 |
| 2836 | 1021400521.09 |
| 2837 | 1041828531.512 |
| 2838 | 1020991960.881 |
| 2839 | 1000572121.664 |
| 2840 | 980560679.23 |
| 2841 | 1000171892.815 |
| 2842 | 980168454.959 |
| 2843 | 960565085.86 |
| 2844 | 979776387.577 |
| 2845 | 960180859.825 |
| 2846 | 940977242.629 |
| 2847 | 959796787.481 |
| 2848 | 978992723.231 |
| 2849 | 959412868.766 |
| 2850 | 978601126.142 |
| 2851 | 998173148.664 |
| 2852 | 978209685.691 |
| 2853 | 958645491.977 |
| 2854 | 977818401.817 |
| 2855 | 997374769.853 |
| 2856 | 977427274.456 |
| 2857 | 957878728.967 |
| 2858 | 977036303.546 |
| 2859 | 996577029.617 |
| 2860 | 1016508570.21 |
| 2861 | 996178398.805 |
| 2862 | 1016101966.782 |
| 2863 | 995779927.446 |
| 2864 | 1015695525.995 |
| 2865 | 1036009436.515 |
| 2866 | 1015289247.784 |
| 2867 | 1035595032.74 |
| 2868 | 1014883132.085 |
| 2869 | 994585469.444 |
| 2870 | 1014477178.832 |
| 2871 | 1034766722.409 |
| 2872 | 1055462056.857 |
| 2873 | 1034352815.72 |
| 2874 | 1055039872.035 |
| 2875 | 1033939074.594 |
| 2876 | 1013260293.102 |
| 2877 | 992995087.24 |
| 2878 | 1012854988.985 |
| 2879 | 992597889.205 |
| 2880 | 1012449846.989 |
| 2881 | 1032698843.929 |
| 2882 | 1053352820.808 |
| 2883 | 1074419877.224 |
| 2884 | 1095908274.768 |
| 2885 | 1073990109.273 |
| 2886 | 1095469911.458 |
| 2887 | 1117379309.687 |
| 2888 | 1139726895.881 |
| 2889 | 1162521433.799 |
| 2890 | 1185771862.475 |
| 2891 | 1162056425.225 |
| 2892 | 1138815296.721 |
| 2893 | 1161591602.655 |
| 2894 | 1184823434.708 |
| 2895 | 1208519903.402 |
| 2896 | 1184349505.334 |
| 2897 | 1208036495.441 |
| 2898 | 1183875765.532 |
| 2899 | 1207553280.843 |
| 2900 | 1183402215.226 |
| 2901 | 1207070259.531 |
| 2902 | 1182928854.34 |
| 2903 | 1159270277.253 |
| 2904 | 1182455682.798 |
| 2905 | 1206104796.454 |
| 2906 | 1181982700.525 |
| 2907 | 1158343046.515 |
| 2908 | 1181509907.445 |
| 2909 | 1157879709.296 |
| 2910 | 1134722115.11 |
| 2911 | 1112027672.808 |
| 2912 | 1134268226.264 |
| 2913 | 1156953590.789 |
| 2914 | 1180092662.605 |
| 2915 | 1203694515.857 |
| 2916 | 1179620625.54 |
| 2917 | 1156028213.029 |
| 2918 | 1179148777.29 |
| 2919 | 1155565801.744 |
| 2920 | 1132454485.709 |
| 2921 | 1155103575.423 |
| 2922 | 1132001503.915 |
| 2923 | 1109361473.837 |
| 2924 | 1131548703.313 |
| 2925 | 1108917729.247 |
| 2926 | 1086739374.662 |
| 2927 | 1065004587.169 |
| 2928 | 1086304678.912 |
| 2929 | 1108030772.49 |
| 2930 | 1130191387.94 |
| 2931 | 1152795215.699 |
| 2932 | 1175851120.013 |
| 2933 | 1152334097.613 |
| 2934 | 1175380779.565 |
| 2935 | 1151873163.974 |
| 2936 | 1174910627.253 |
| 2937 | 1198408839.798 |
| 2938 | 1222377016.594 |
| 2939 | 1246824556.926 |
| 2940 | 1271761048.065 |
| 2941 | 1246325827.103 |
| 2942 | 1271252343.645 |
| 2943 | 1245827296.773 |
| 2944 | 1270743842.708 |
| 2945 | 1296158719.562 |
| 2946 | 1270235545.171 |
| 2947 | 1295640256.074 |
| 2948 | 1321553061.196 |
| 2949 | 1347984122.42 |
| 2950 | 1374943804.868 |
| 2951 | 1402442680.966 |
| 2952 | 1374393827.346 |
| 2953 | 1401881703.893 |
| 2954 | 1429919337.971 |
| 2955 | 1458517724.73 |
| 2956 | 1487688079.225 |
| 2957 | 1517441840.81 |
| 2958 | 1487093003.993 |
| 2959 | 1457351143.913 |
| 2960 | 1428204121.035 |
| 2961 | 1456768203.456 |
| 2962 | 1485903567.525 |
| 2963 | 1515621638.876 |
| 2964 | 1545934071.653 |
| 2965 | 1576852753.086 |
| 2966 | 1545315698.024 |
| 2967 | 1576222011.985 |
| 2968 | 1607746452.225 |
| 2969 | 1639901381.269 |
| 2970 | 1672699408.894 |
| 2971 | 1639245420.717 |
| 2972 | 1672030329.131 |
| 2973 | 1638589722.548 |
| 2974 | 1605817928.097 |
| 2975 | 1573701569.535 |
| 2976 | 1605175600.926 |
| 2977 | 1637279112.945 |
| 2978 | 1670024695.203 |
| 2979 | 1703425189.108 |
| 2980 | 1669356685.325 |
| 2981 | 1635969551.619 |
| 2982 | 1668688942.651 |
| 2983 | 1635315163.798 |
| 2984 | 1668021467.074 |
| 2985 | 1634661037.733 |
| 2986 | 1667354258.487 |
| 2987 | 1634007173.318 |
| 2988 | 1601327029.851 |
| 2989 | 1633353570.448 |
| 2990 | 1600686499.039 |
| 2991 | 1632700229.02 |
| 2992 | 1665354233.601 |
| 2993 | 1698661318.273 |
| 2994 | 1732634544.638 |
| 2995 | 1767287235.531 |
| 2996 | 1731941490.82 |
| 2997 | 1766580320.637 |
| 2998 | 1801911927.049 |
| 2999 | 1837950165.59 |
| 3000 | 1874709168.902 |
| 3001 | 1912203352.28 |
| 3002 | 1873959285.234 |
| 3003 | 1911438470.939 |
| 3004 | 1949667240.358 |
| 3005 | 1988660585.165 |
| 3006 | 2028433796.868 |
| 3007 | 2069002472.806 |
| 3008 | 2110382522.262 |
| 3009 | 2152590172.707 |
| 3010 | 2195641976.161 |
| 3011 | 2239554815.685 |
| 3012 | 2194763719.371 |
| 3013 | 2150868444.983 |
| 3014 | 2107851076.084 |
| 3015 | 2150008097.605 |
| 3016 | 2107007935.653 |
| 3017 | 2149148094.366 |
| 3018 | 2192131056.254 |
| 3019 | 2235973677.379 |
| 3020 | 2280693150.926 |
| 3021 | 2235079287.908 |
| 3022 | 2279780873.666 |
| 3023 | 2325376491.139 |
| 3024 | 2278868961.317 |
| 3025 | 2233291582.09 |
| 3026 | 2277957413.732 |
| 3027 | 2323516562.007 |
| 3028 | 2277046230.766 |
| 3029 | 2322587155.382 |
| 3030 | 2369038898.489 |
| 3031 | 2321658120.52 |
| 3032 | 2275224958.109 |
| 3033 | 2320729457.271 |
| 3034 | 2367144046.417 |
| 3035 | 2414486927.345 |
| 3036 | 2462776665.892 |
| 3037 | 2512032199.21 |
| 3038 | 2461791555.226 |
| 3039 | 2412555724.121 |
| 3040 | 2460806838.604 |
| 3041 | 2411590701.832 |
| 3042 | 2363358887.795 |
| 3043 | 2316091710.039 |
| 3044 | 2269769875.838 |
| 3045 | 2224374478.322 |
| 3046 | 2268861967.888 |
| 3047 | 2314239207.246 |
| 3048 | 2267954423.101 |
| 3049 | 2313313511.563 |
| 3050 | 2359579781.794 |
| 3051 | 2406771377.43 |
| 3052 | 2454906804.979 |
| 3053 | 2405808668.879 |
| 3054 | 2453924842.257 |
| 3055 | 2404846345.411 |
| 3056 | 2452943272.32 |
| 3057 | 2502002137.766 |
| 3058 | 2552042180.521 |
| 3059 | 2603083024.132 |
| 3060 | 2551021363.649 |
| 3061 | 2500000936.376 |
| 3062 | 2450000917.649 |
| 3063 | 2499000936.002 |
| 3064 | 2548980954.722 |
| 3065 | 2599960573.816 |
| 3066 | 2547961362.34 |
| 3067 | 2598920589.587 |
| 3068 | 2546942177.795 |
| 3069 | 2597881021.351 |
| 3070 | 2649838641.778 |
| 3071 | 2702835414.613 |
| 3072 | 2756892122.906 |
| 3073 | 2812029965.364 |
| 3074 | 2868270564.671 |
| 3075 | 2810905153.378 |
| 3076 | 2754687050.31 |
| 3077 | 2809780791.316 |
| 3078 | 2865976407.143 |
| 3079 | 2923295935.285 |
| 3080 | 2981761853.991 |
| 3081 | 2922126616.911 |
| 3082 | 2980569149.249 |
| 3083 | 2920957766.264 |
| 3084 | 2862538610.939 |
| 3085 | 2919789383.158 |
| 3086 | 2861393595.495 |
| 3087 | 2804165723.585 |
| 3088 | 2860249038.057 |
| 3089 | 2917454018.818 |
| 3090 | 2859104938.441 |
| 3091 | 2916287037.21 |
| 3092 | 2857961296.466 |
| 3093 | 2800802070.537 |
| 3094 | 2856818111.947 |
| 3095 | 2799681749.708 |
| 3096 | 2743688114.714 |
| 3097 | 2798561877.009 |
| 3098 | 2854533114.549 |
| 3099 | 2911623776.84 |
| 3100 | 2853391301.303 |
| 3101 | 2910459127.329 |
| 3102 | 2852249944.782 |
| 3103 | 2909294943.678 |
| 3104 | 2851109044.805 |
| 3105 | 2794086863.908 |
| 3106 | 2849968601.187 |
| 3107 | 2906967973.21 |
| 3108 | 2848828613.746 |
| 3109 | 2791852041.471 |
| 3110 | 2736015000.642 |
| 3111 | 2681294700.629 |
| 3112 | 2627668806.616 |
| 3113 | 2680222182.749 |
| 3114 | 2626617739.094 |
| 3115 | 2574085384.312 |
| 3116 | 2625567091.998 |
| 3117 | 2573055750.158 |
| 3118 | 2624516865.161 |
| 3119 | 2572026527.858 |
| 3120 | 2623467058.415 |
| 3121 | 2675936399.584 |
| 3122 | 2622417671.592 |
| 3123 | 2674866025.024 |
| 3124 | 2621368704.523 |
| 3125 | 2673796078.614 |
| 3126 | 2620320157.041 |
| 3127 | 2567913753.901 |
| 3128 | 2516555478.823 |
| 3129 | 2466224369.246 |
| 3130 | 2515548856.631 |
| 3131 | 2465237879.498 |
| 3132 | 2415933121.908 |
| 3133 | 2367614459.47 |
| 3134 | 2320262170.281 |
| 3135 | 2273856926.875 |
| 3136 | 2228379788.338 |
| 3137 | 2272947384.105 |
| 3138 | 2318406331.787 |
| 3139 | 2272038205.151 |
| 3140 | 2226597441.048 |
| 3141 | 2271129389.869 |
| 3142 | 2316551977.666 |
| 3143 | 2362883017.22 |
| 3144 | 2315625356.875 |
| 3145 | 2361937864.013 |
| 3146 | 2314699106.732 |
| 3147 | 2268405124.598 |
| 3148 | 2223037022.106 |
| 3149 | 2178576281.664 |
| 3150 | 2222147807.297 |
| 3151 | 2177704851.151 |
| 3152 | 2221258948.174 |
| 3153 | 2265684127.137 |
| 3154 | 2310997809.68 |
| 3155 | 2357217765.874 |
| 3156 | 2310073410.556 |
| 3157 | 2356274878.767 |
| 3158 | 2403400376.343 |
| 3159 | 2355332368.816 |
| 3160 | 2308225721.44 |
| 3161 | 2354390235.868 |
| 3162 | 2307302431.151 |
| 3163 | 2261156382.528 |
| 3164 | 2215933254.878 |
| 3165 | 2260251919.975 |
| 3166 | 2305456958.375 |
| 3167 | 2351566097.542 |
| 3168 | 2304534775.591 |
| 3169 | 2350625471.103 |
| 3170 | 2397637980.525 |
| 3171 | 2445590740.136 |
| 3172 | 2494502554.938 |
| 3173 | 2444612503.84 |
| 3174 | 2395720253.763 |
| 3175 | 2443634658.838 |
| 3176 | 2492507352.015 |
| 3177 | 2442657204.974 |
| 3178 | 2393804060.875 |
| 3179 | 2345927979.657 |
| 3180 | 2392846539.251 |
| 3181 | 2440703470.036 |
| 3182 | 2489517539.436 |
| 3183 | 2439727188.648 |
| 3184 | 2488521732.421 |
| 3185 | 2538292167.069 |
| 3186 | 2589058010.41 |
| 3187 | 2640839170.619 |
| 3188 | 2693655954.031 |
| 3189 | 2747529073.112 |
| 3190 | 2692578491.649 |
| 3191 | 2638726921.816 |
| 3192 | 2691501460.253 |
| 3193 | 2745331489.458 |
| 3194 | 2690424859.669 |
| 3195 | 2636616362.475 |
| 3196 | 2583884035.226 |
| 3197 | 2635561715.93 |
| 3198 | 2688272950.249 |
| 3199 | 2634507491.244 |
| 3200 | 2687197641.069 |
| 3201 | 2740941593.89 |
| 3202 | 2795760425.768 |
| 3203 | 2851675634.283 |
| 3204 | 2794642121.598 |
| 3205 | 2738749279.166 |
| 3206 | 2683974293.582 |
| 3207 | 2737653779.454 |
| 3208 | 2792406855.043 |
| 3209 | 2848254992.144 |
| 3210 | 2905220091.987 |
| 3211 | 2963324493.827 |
| 3212 | 3022590983.703 |
| 3213 | 2962139164.029 |
| 3214 | 2902896380.748 |
| 3215 | 2960954308.363 |
| 3216 | 2901735222.196 |
| 3217 | 2959769926.64 |
| 3218 | 3018965325.173 |
| 3219 | 3079344631.676 |
| 3220 | 3017757739.043 |
| 3221 | 3078112893.824 |
| 3222 | 3016550635.947 |
| 3223 | 3076881648.666 |
| 3224 | 3015344015.693 |
| 3225 | 3075650896.007 |
| 3226 | 3137163913.927 |
| 3227 | 3199907192.205 |
| 3228 | 3135909048.361 |
| 3229 | 3198627229.328 |
| 3230 | 3262599773.915 |
| 3231 | 3327851769.393 |
| 3232 | 3394408804.781 |
| 3233 | 3462296980.877 |
| 3234 | 3393051041.259 |
| 3235 | 3460912062.084 |
| 3236 | 3530130303.326 |
| 3237 | 3600732909.393 |
| 3238 | 3672747567.58 |
| 3239 | 3746202518.932 |
| 3240 | 3671278468.553 |
| 3241 | 3744704037.925 |
| 3242 | 3819598118.683 |
| 3243 | 3895990081.057 |
| 3244 | 3818070279.436 |
| 3245 | 3894431685.024 |
| 3246 | 3816543051.324 |
| 3247 | 3892873912.35 |
| 3248 | 3815016434.103 |
| 3249 | 3738716105.421 |
| 3250 | 3813490427.53 |
| 3251 | 3889760236.08 |
| 3252 | 3967555440.802 |
| 3253 | 3888204331.986 |
| 3254 | 3810440245.346 |
| 3255 | 3886649050.253 |
| 3256 | 3808916069.248 |
| 3257 | 3732737747.863 |
| 3258 | 3658082992.906 |
| 3259 | 3584921333.048 |
| 3260 | 3656619759.709 |
| 3261 | 3729752154.903 |
| 3262 | 3804347198.001 |
| 3263 | 3728260254.041 |
| 3264 | 3653695048.96 |
| 3265 | 3580621147.981 |
| 3266 | 3509008725.021 |
| 3267 | 3438828550.521 |
| 3268 | 3507605121.531 |
| 3269 | 3437453019.1 |
| 3270 | 3506202079.482 |
| 3271 | 3576326121.072 |
| 3272 | 3504799598.651 |
| 3273 | 3574895590.624 |
| 3274 | 3646393502.436 |
| 3275 | 3719321372.485 |
| 3276 | 3644934945.035 |
| 3277 | 3572036246.134 |
| 3278 | 3643476971.057 |
| 3279 | 3716346510.478 |
| 3280 | 3790673440.688 |
| 3281 | 3866486909.502 |
| 3282 | 3943816647.692 |
| 3283 | 3864940314.738 |
| 3284 | 3942239121.033 |
| 3285 | 4021083903.453 |
| 3286 | 3940662225.384 |
| 3287 | 3861848980.877 |
| 3288 | 3784612001.259 |
| 3289 | 3708919761.234 |
| 3290 | 3783098156.458 |
| 3291 | 3858760119.588 |
| 3292 | 3935935321.979 |
| 3293 | 4014654028.419 |
| 3294 | 4094947108.987 |
| 3295 | 4013048166.808 |
| 3296 | 3932787203.471 |
| 3297 | 3854131459.402 |
| 3298 | 3931214088.59 |
| 3299 | 4009838370.362 |
| 3300 | 3929641602.955 |
| 3301 | 3851048770.896 |
| 3302 | 3928069746.313 |
| 3303 | 3849508351.387 |
| 3304 | 3772518184.359 |
| 3305 | 3847968548.047 |
| 3306 | 3771009177.086 |
| 3307 | 3846429360.627 |
| 3308 | 3923357947.84 |
| 3309 | 4001825106.797 |
| 3310 | 3921788604.661 |
| 3311 | 4000224376.754 |
| 3312 | 3920219889.219 |
| 3313 | 3998624287.003 |
| 3314 | 4078596772.743 |
| 3315 | 4160168708.198 |
| 3316 | 4076965334.034 |
| 3317 | 4158504640.715 |
| 3318 | 4241674733.529 |
| 3319 | 4156841238.859 |
| 3320 | 4239978063.636 |
| 3321 | 4324777624.909 |
| 3322 | 4238282072.41 |
| 3323 | 4323047713.859 |
| 3324 | 4409508668.136 |
| 3325 | 4321318494.773 |
| 3326 | 4407744864.669 |
| 3327 | 4319589967.375 |
| 3328 | 4233198168.028 |
| 3329 | 4148534204.667 |
| 3330 | 4065563520.574 |
| 3331 | 4146874790.985 |
| 3332 | 4063937295.166 |
| 3333 | 3982658549.262 |
| 3334 | 3903005378.277 |
| 3335 | 3981065485.843 |
| 3336 | 4060686795.559 |
| 3337 | 4141900531.471 |
| 3338 | 4224738542.1 |
| 3339 | 4140243771.258 |
| 3340 | 4223048646.683 |
| 3341 | 4307509619.617 |
| 3342 | 4393659812.009 |
| 3343 | 4305786615.769 |
| 3344 | 4219670883.454 |
| 3345 | 4135277465.785 |
| 3346 | 4052571916.469 |
| 3347 | 4133623354.798 |
| 3348 | 4216295821.894 |
| 3349 | 4300621738.332 |
| 3350 | 4386634173.099 |
| 3351 | 4474366856.561 |
| 3352 | 4384879519.429 |
| 3353 | 4472577109.818 |
| 3354 | 4562028652.014 |
| 3355 | 4653269225.055 |
| 3356 | 4746334609.556 |
| 3357 | 4651407917.365 |
| 3358 | 4558379759.017 |
| 3359 | 4467212163.837 |
| 3360 | 4556556407.114 |
| 3361 | 4647687535.256 |
| 3362 | 4740641285.961 |
| 3363 | 4835454111.68 |
| 3364 | 4932163193.914 |
| 3365 | 5030806457.792 |
| 3366 | 4930190328.636 |
| 3367 | 5028794135.209 |
| 3368 | 5129370017.913 |
| 3369 | 5231957418.272 |
| 3370 | 5127318269.906 |
| 3371 | 5024771904.508 |
| 3372 | 5125267342.598 |
| 3373 | 5022761995.746 |
| 3374 | 4922306755.831 |
| 3375 | 5020752890.948 |
| 3376 | 4920337833.129 |
| 3377 | 5018744589.792 |
| 3378 | 5119119481.587 |
| 3379 | 5221501871.219 |
| 3380 | 5325931908.644 |
| 3381 | 5219413270.471 |
| 3382 | 5323801535.88 |
| 3383 | 5217325505.162 |
| 3384 | 5321672015.266 |
| 3385 | 5428105455.571 |
| 3386 | 5319543346.46 |
| 3387 | 5425934213.389 |
| 3388 | 5534452897.657 |
| 3389 | 5645141955.61 |
| 3390 | 5532239116.498 |
| 3391 | 5421594334.168 |
| 3392 | 5313162447.484 |
| 3393 | 5206899198.535 |
| 3394 | 5311037182.505 |
| 3395 | 5417257926.155 |
| 3396 | 5525603084.678 |
| 3397 | 5636115146.372 |
| 3398 | 5523392843.445 |
| 3399 | 5633860700.313 |
| 3400 | 5521183486.307 |
| 3401 | 5631607156.033 |
| 3402 | 5744239299.154 |
| 3403 | 5859124085.137 |
| 3404 | 5976306566.84 |
| 3405 | 6095832698.177 |
| 3406 | 6217749352.14 |
| 3407 | 6342104339.183 |
| 3408 | 6468946425.967 |
| 3409 | 6339567497.447 |
| 3410 | 6212776147.498 |
| 3411 | 6337031670.448 |
| 3412 | 6463772303.857 |
| 3413 | 6593047749.934 |
| 3414 | 6724908704.933 |
| 3415 | 6590410530.834 |
| 3416 | 6722218741.451 |
| 3417 | 6587774366.622 |
| 3418 | 6456018879.29 |
| 3419 | 6585139256.875 |
| 3420 | 6453436471.738 |
| 3421 | 6582505201.173 |
| 3422 | 6714155305.196 |
| 3423 | 6579872199.092 |
| 3424 | 6711469643.074 |
| 3425 | 6577240250.213 |
| 3426 | 6708785055.217 |
| 3427 | 6842960756.321 |
| 3428 | 6979819971.448 |
| 3429 | 6840223572.019 |
| 3430 | 6703419100.578 |
| 3431 | 6837487482.59 |
| 3432 | 6700737732.938 |
| 3433 | 6834752487.597 |
| 3434 | 6971447537.349 |
| 3435 | 7110876488.096 |
| 3436 | 7253094017.858 |
| 3437 | 7108032137.501 |
| 3438 | 7250192780.251 |
| 3439 | 7105188924.646 |
| 3440 | 7247292703.138 |
| 3441 | 7392238557.201 |
| 3442 | 7540083328.345 |
| 3443 | 7690884994.912 |
| 3444 | 7537067295.014 |
| 3445 | 7386325949.114 |
| 3446 | 7534052468.096 |
| 3447 | 7383371418.734 |
| 3448 | 7531038847.109 |
| 3449 | 7380418070.166 |
| 3450 | 7528026431.57 |
| 3451 | 7377465902.938 |
| 3452 | 7525015220.997 |
| 3453 | 7374514916.577 |
| 3454 | 7522005214.909 |
| 3455 | 7672445319.207 |
| 3456 | 7825894225.591 |
| 3457 | 7982412110.103 |
| 3458 | 8142060352.305 |
| 3459 | 8304901559.351 |
| 3460 | 8470999590.538 |
| 3461 | 8640419582.349 |
| 3462 | 8813227973.996 |
| 3463 | 8636963414.516 |
| 3464 | 8809702682.806 |
| 3465 | 8633508629.15 |
| 3466 | 8460838456.567 |
| 3467 | 8630055225.698 |
| 3468 | 8457454121.184 |
| 3469 | 8288305038.761 |
| 3470 | 8454071139.536 |
| 3471 | 8623152562.327 |
| 3472 | 8795615613.573 |
| 3473 | 8971527925.845 |
| 3474 | 9150958484.362 |
| 3475 | 9333977654.049 |
| 3476 | 9520657207.13 |
| 3477 | 9330244062.987 |
| 3478 | 9143639181.727 |
| 3479 | 9326511965.362 |
| 3480 | 9513042204.669 |
| 3481 | 9703303048.763 |
| 3482 | 9509236987.787 |
| 3483 | 9319052248.032 |
| 3484 | 9505433292.992 |
| 3485 | 9695541958.852 |
| 3486 | 9501631119.675 |
| 3487 | 9691663742.069 |
| 3488 | 9497830467.227 |
| 3489 | 9307873857.883 |
| 3490 | 9121716380.725 |
| 3491 | 8939282053.111 |
| 3492 | 8760496412.048 |
| 3493 | 8585286483.807 |
| 3494 | 8756992213.483 |
| 3495 | 8581852369.214 |
| 3496 | 8410215321.83 |
| 3497 | 8578419628.266 |
| 3498 | 8406851235.701 |
| 3499 | 8574988260.415 |
| 3500 | 8403488495.207 |
| 3501 | 8571558265.111 |
| 3502 | 8400127099.808 |
| 3503 | 8232124557.812 |
| 3504 | 8067482066.656 |
| 3505 | 7906132425.323 |
| 3506 | 8064255073.829 |
| 3507 | 8225540175.306 |
| 3508 | 8390050978.812 |
| 3509 | 8557851998.388 |
| 3510 | 8729009038.356 |
| 3511 | 8903589219.123 |
| 3512 | 9081661003.506 |
| 3513 | 9263294223.576 |
| 3514 | 9078028339.104 |
| 3515 | 8896467772.322 |
| 3516 | 9074397127.769 |
| 3517 | 9255885070.324 |
| 3518 | 9441002771.73 |
| 3519 | 9252182716.296 |
| 3520 | 9437226370.622 |
| 3521 | 9625970898.034 |
| 3522 | 9818490315.995 |
| 3523 | 10014860122.315 |
| 3524 | 10215157324.761 |
| 3525 | 10419460471.256 |
| 3526 | 10211071261.831 |
| 3527 | 10415292687.068 |
| 3528 | 10623598540.809 |
| 3529 | 10836070511.625 |
| 3530 | 11052791921.858 |
| 3531 | 10831736083.421 |
| 3532 | 11048370805.089 |
| 3533 | 11269338221.191 |
| 3534 | 11043951456.767 |
| 3535 | 11264830485.902 |
| 3536 | 11490127095.62 |
| 3537 | 11719929637.533 |
| 3538 | 11485531044.782 |
| 3539 | 11715241665.678 |
| 3540 | 11949546498.991 |
| 3541 | 12188537428.971 |
| 3542 | 12432308177.551 |
| 3543 | 12680954341.102 |
| 3544 | 12427335254.28 |
| 3545 | 12675881959.365 |
| 3546 | 12422364320.178 |
| 3547 | 12670811606.582 |
| 3548 | 12924227838.713 |
| 3549 | 13182712395.487 |
| 3550 | 13446366643.397 |
| 3551 | 13177439310.529 |
| 3552 | 13440988096.74 |
| 3553 | 13709807858.675 |
| 3554 | 13984004015.848 |
| 3555 | 14263684096.165 |
| 3556 | 14548957778.088 |
| 3557 | 14839936933.65 |
| 3558 | 15136735672.323 |
| 3559 | 15439470385.77 |
| 3560 | 15748259793.485 |
| 3561 | 16063224989.355 |
| 3562 | 16384489489.142 |
| 3563 | 16712179278.925 |
| 3564 | 17046422864.503 |
| 3565 | 17387351321.793 |
| 3566 | 17039604295.357 |
| 3567 | 17380396381.264 |
| 3568 | 17032788453.639 |
| 3569 | 17373444222.712 |
| 3570 | 17720913107.166 |
| 3571 | 17366494845.023 |
| 3572 | 17713824741.923 |
| 3573 | 18068101236.762 |
| 3574 | 18429463261.497 |
| 3575 | 18798052526.727 |
| 3576 | 18422091476.192 |
| 3577 | 18790533305.716 |
| 3578 | 19166343971.831 |
| 3579 | 18783017092.394 |
| 3580 | 19158677434.242 |
| 3581 | 19541850982.927 |
| 3582 | 19151013963.268 |
| 3583 | 18767993684.003 |
| 3584 | 19143353557.683 |
| 3585 | 19526220628.836 |
| 3586 | 19916745041.413 |
| 3587 | 20315079942.242 |
| 3588 | 20721381541.086 |
| 3589 | 20306953910.265 |
| 3590 | 20713092988.47 |
| 3591 | 20298831128.7 |
| 3592 | 20704807751.274 |
| 3593 | 20290711596.249 |
| 3594 | 19884897364.324 |
| 3595 | 20282595311.61 |
| 3596 | 20688247217.843 |
| 3597 | 20274482273.486 |
| 3598 | 19868992628.016 |
| 3599 | 19471612775.456 |
| 3600 | 19082180519.947 |
| 3601 | 18700536909.548 |
| 3602 | 19074547647.739 |
| 3603 | 19456038600.694 |
| 3604 | 19845159372.707 |
| 3605 | 19448256185.253 |
| 3606 | 19837221308.958 |
| 3607 | 19440476882.779 |
| 3608 | 19829286420.435 |
| 3609 | 19432700692.026 |
| 3610 | 19044046678.186 |
| 3611 | 19424927611.749 |
| 3612 | 19813426163.984 |
| 3613 | 19417157640.704 |
| 3614 | 19028814487.89 |
| 3615 | 19409390777.648 |
| 3616 | 19021202962.095 |
| 3617 | 19401627021.337 |
| 3618 | 19013594480.91 |
| 3619 | 18633322591.292 |
| 3620 | 19005989043.118 |
| 3621 | 18625869262.256 |
| 3622 | 18998386647.501 |
| 3623 | 18618418914.551 |
| 3624 | 18246050536.26 |
| 3625 | 17881129525.535 |
| 3626 | 17523506935.024 |
| 3627 | 17173036796.323 |
| 3628 | 17516497532.25 |
| 3629 | 17866827482.895 |
| 3630 | 17509490933.237 |
| 3631 | 17859680751.902 |
| 3632 | 17502487136.864 |
| 3633 | 17852536879.601 |
| 3634 | 18209587617.193 |
| 3635 | 17845395864.849 |
| 3636 | 17488487947.552 |
| 3637 | 17138718188.601 |
| 3638 | 17481492552.373 |
| 3639 | 17831122403.421 |
| 3640 | 18187744851.489 |
| 3641 | 17823989954.459 |
| 3642 | 18180469753.548 |
| 3643 | 18544079148.619 |
| 3644 | 18914960731.592 |
| 3645 | 19293259946.224 |
| 3646 | 19679125145.148 |
| 3647 | 19285542642.245 |
| 3648 | 19671253495.09 |
| 3649 | 20064678564.992 |
| 3650 | 20465972136.292 |
| 3651 | 20875291579.017 |
| 3652 | 21292797410.598 |
| 3653 | 20866941462.386 |
| 3654 | 21284280291.634 |
| 3655 | 21709965897.466 |
| 3656 | 21275766579.517 |
| 3657 | 20850251247.927 |
| 3658 | 21267256272.885 |
| 3659 | 21692601398.343 |
| 3660 | 22126453426.31 |
| 3661 | 22568982494.836 |
| 3662 | 22117602844.939 |
| 3663 | 22559954901.838 |
| 3664 | 22108755803.801 |
| 3665 | 21666580687.725 |
| 3666 | 22099912301.48 |
| 3667 | 21657914055.45 |
| 3668 | 22091072336.559 |
| 3669 | 21649250889.828 |
| 3670 | 22082235907.624 |
| 3671 | 21640591189.472 |
| 3672 | 22073403013.261 |
| 3673 | 21631934952.996 |
| 3674 | 22064573652.056 |
| 3675 | 21623282179.015 |
| 3676 | 22055747822.595 |
| 3677 | 22496862779.047 |
| 3678 | 22046925523.466 |
| 3679 | 21605987012.997 |
| 3680 | 22038106753.257 |
| 3681 | 22478868888.322 |
| 3682 | 22029291510.556 |
| 3683 | 22469877340.767 |
| 3684 | 22020479793.951 |
| 3685 | 21580070198.072 |
| 3686 | 22011671602.034 |
| 3687 | 22451905034.074 |
| 3688 | 22002866933.393 |
| 3689 | 22442924272.061 |
| 3690 | 22891782757.502 |
| 3691 | 22433947102.352 |
| 3692 | 21985268160.305 |
| 3693 | 22424973523.511 |
| 3694 | 21976474053.041 |
| 3695 | 22416003534.102 |
| 3696 | 21967683463.42 |
| 3697 | 22407037132.688 |
| 3698 | 22855177875.342 |
| 3699 | 22398074317.835 |
| 3700 | 22846035804.192 |
| 3701 | 22389115088.108 |
| 3702 | 22836897389.87 |
| 3703 | 23293635337.667 |
| 3704 | 23759508044.421 |
| 3705 | 24234698205.309 |
| 3706 | 23750004241.203 |
| 3707 | 24225004326.027 |
| 3708 | 24709504412.547 |
| 3709 | 25203694500.798 |
| 3710 | 25707768390.814 |
| 3711 | 25193613022.998 |
| 3712 | 25697485283.458 |
| 3713 | 25183535577.789 |
| 3714 | 24679864866.233 |
| 3715 | 24186267568.908 |
| 3716 | 24669992920.287 |
| 3717 | 25163392778.692 |
| 3718 | 25666660634.266 |
| 3719 | 26179993846.952 |
| 3720 | 26703593723.89 |
| 3721 | 27237665598.368 |
| 3722 | 27782418910.336 |
| 3723 | 28338067288.542 |
| 3724 | 28904828634.313 |
| 3725 | 29482925207 |
| 3726 | 30072583711.14 |
| 3727 | 30674035385.362 |
| 3728 | 30060554677.655 |
| 3729 | 30661765771.208 |
| 3730 | 31275001086.632 |
| 3731 | 31900501108.365 |
| 3732 | 32538511130.532 |
| 3733 | 31887740907.922 |
| 3734 | 31249986089.763 |
| 3735 | 30624986367.968 |
| 3736 | 30012486640.609 |
| 3737 | 29412236907.796 |
| 3738 | 28823992169.64 |
| 3739 | 28247512326.248 |
| 3740 | 28812462572.773 |
| 3741 | 28236213321.317 |
| 3742 | 27671489054.891 |
| 3743 | 27118059273.793 |
| 3744 | 27660420459.269 |
| 3745 | 27107212050.084 |
| 3746 | 27649356291.085 |
| 3747 | 28202343416.907 |
| 3748 | 28766390285.245 |
| 3749 | 28191062479.54 |
| 3750 | 28754883729.131 |
| 3751 | 29329981403.714 |
| 3752 | 29916581031.788 |
| 3753 | 30514912652.424 |
| 3754 | 31125210905.472 |
| 3755 | 31747715123.582 |
| 3756 | 32382669426.053 |
| 3757 | 33030322814.574 |
| 3758 | 33690929270.866 |
| 3759 | 34364747856.283 |
| 3760 | 35052042813.409 |
| 3761 | 35753083669.677 |
| 3762 | 36468145343.07 |
| 3763 | 37197508249.932 |
| 3764 | 36453558084.933 |
| 3765 | 37182629246.632 |
| 3766 | 37926281831.564 |
| 3767 | 38684807468.196 |
| 3768 | 37911111318.832 |
| 3769 | 38669333545.208 |
| 3770 | 39442720216.113 |
| 3771 | 40231574620.435 |
| 3772 | 41036206112.844 |
| 3773 | 41856930235.1 |
| 3774 | 41019791630.398 |
| 3775 | 41840187463.006 |
| 3776 | 42676991212.266 |
| 3777 | 43530531036.512 |
| 3778 | 44401141657.242 |
| 3779 | 45289164490.387 |
| 3780 | 44383381200.579 |
| 3781 | 45271048824.591 |
| 3782 | 46176469801.082 |
| 3783 | 47099999197.104 |
| 3784 | 48041999181.046 |
| 3785 | 49002839164.667 |
| 3786 | 49982895947.961 |
| 3787 | 50982553866.92 |
| 3788 | 52002204944.258 |
| 3789 | 50962160845.373 |
| 3790 | 51981404062.28 |
| 3791 | 53021032143.526 |
| 3792 | 54081452786.397 |
| 3793 | 52999823730.669 |
| 3794 | 54059820205.282 |
| 3795 | 52978623801.176 |
| 3796 | 51919051325.153 |
| 3797 | 50880670298.65 |
| 3798 | 51898283704.623 |
| 3799 | 50860318030.53 |
| 3800 | 51877524391.141 |
| 3801 | 50839973903.318 |
| 3802 | 51856773381.384 |
| 3803 | 52893908849.012 |
| 3804 | 53951787025.992 |
| 3805 | 55030822766.512 |
| 3806 | 56131439221.842 |
| 3807 | 57254068006.279 |
| 3808 | 58399149366.405 |
| 3809 | 59567132353.733 |
| 3810 | 60758475000.808 |
| 3811 | 61973644500.824 |
| 3812 | 63213117390.84 |
| 3813 | 64477379738.657 |
| 3814 | 65766927333.43 |
| 3815 | 64451588786.762 |
| 3816 | 63162557011.026 |
| 3817 | 64425808151.247 |
| 3818 | 63137291988.222 |
| 3819 | 64400037827.986 |
| 3820 | 63112037071.427 |
| 3821 | 61849796329.998 |
| 3822 | 63086792256.598 |
| 3823 | 61825056411.466 |
| 3824 | 60588555283.237 |
| 3825 | 59376784177.572 |
| 3826 | 60564319861.124 |
| 3827 | 61775606258.346 |
| 3828 | 63011118383.513 |
| 3829 | 64271340751.183 |
| 3830 | 62985913936.16 |
| 3831 | 64245632214.883 |
| 3832 | 65530544859.18 |
| 3833 | 66841155756.364 |
| 3834 | 68177978871.491 |
| 3835 | 69541538448.921 |
| 3836 | 70932369217.9 |
| 3837 | 72351016602.258 |
| 3838 | 73798036934.303 |
| 3839 | 72322076195.617 |
| 3840 | 73768517719.529 |
| 3841 | 75243888073.92 |
| 3842 | 76748765835.398 |
| 3843 | 78283741152.106 |
| 3844 | 76718066329.064 |
| 3845 | 75183705002.483 |
| 3846 | 76687379102.532 |
| 3847 | 78221126684.583 |
| 3848 | 76656704150.891 |
| 3849 | 78189838233.909 |
| 3850 | 79753634998.587 |
| 3851 | 81348707698.559 |
| 3852 | 79721733544.588 |
| 3853 | 81316168215.48 |
| 3854 | 82942491579.789 |
| 3855 | 84601341411.385 |
| 3856 | 82909314583.157 |
| 3857 | 84567500874.82 |
| 3858 | 86258850892.317 |
| 3859 | 84533673874.47 |
| 3860 | 86224347351.96 |
| 3861 | 87948834298.999 |
| 3862 | 89707810984.979 |
| 3863 | 91501967204.679 |
| 3864 | 93332006548.772 |
| 3865 | 95198646679.748 |
| 3866 | 93294673746.153 |
| 3867 | 95160567221.076 |
| 3868 | 97063778565.497 |
| 3869 | 99005054136.807 |
| 3870 | 97024953054.071 |
| 3871 | 98965452115.152 |
| 3872 | 100944761157.455 |
| 3873 | 98925865934.306 |
| 3874 | 96947348615.62 |
| 3875 | 98886295587.933 |
| 3876 | 100864021499.691 |
| 3877 | 102881301929.685 |
| 3878 | 100823675891.091 |
| 3879 | 98807202373.27 |
| 3880 | 96831058325.804 |
| 3881 | 94894437159.288 |
| 3882 | 96792325902.474 |
| 3883 | 98728172420.523 |
| 3884 | 96753608972.113 |
| 3885 | 98688681151.555 |
| 3886 | 100662454774.586 |
| 3887 | 98649205679.095 |
| 3888 | 100622189792.676 |
| 3889 | 98609745996.823 |
| 3890 | 96637551076.886 |
| 3891 | 98570302098.424 |
| 3892 | 100541708140.393 |
| 3893 | 102552542303.201 |
| 3894 | 100501491457.137 |
| 3895 | 98491461627.994 |
| 3896 | 100461290860.554 |
| 3897 | 102470516677.765 |
| 3898 | 104519927011.32 |
| 3899 | 106610325551.546 |
| 3900 | 108742532062.577 |
| 3901 | 110917382703.829 |
| 3902 | 113135730357.905 |
| 3903 | 115398444965.064 |
| 3904 | 113090476065.762 |
| 3905 | 115352285587.078 |
| 3906 | 117659331298.819 |
| 3907 | 115306144672.843 |
| 3908 | 113000021779.386 |
| 3909 | 110740021343.798 |
| 3910 | 112954821770.674 |
| 3911 | 115213918206.088 |
| 3912 | 117518196570.209 |
| 3913 | 115167832638.805 |
| 3914 | 117471189291.581 |
| 3915 | 115121765505.75 |
| 3916 | 112819330195.635 |
| 3917 | 110562943591.722 |
| 3918 | 112774202463.556 |
| 3919 | 115029686512.828 |
| 3920 | 117330280243.084 |
| 3921 | 119676885847.946 |
| 3922 | 122070423564.905 |
| 3923 | 124511832036.203 |
| 3924 | 127002068676.927 |
| 3925 | 124462027303.388 |
| 3926 | 121972786757.321 |
| 3927 | 119533331022.174 |
| 3928 | 121923997642.618 |
| 3929 | 119485517689.765 |
| 3930 | 121875228043.561 |
| 3931 | 119437723482.689 |
| 3932 | 121826477952.343 |
| 3933 | 124263007511.39 |
| 3934 | 121777747361.162 |
| 3935 | 119342192413.939 |
| 3936 | 116955348565.66 |
| 3937 | 114616241594.347 |
| 3938 | 116908566426.234 |
| 3939 | 119246737754.759 |
| 3940 | 116861802999.663 |
| 3941 | 114524566939.67 |
| 3942 | 116815058278.464 |
| 3943 | 114478757112.894 |
| 3944 | 112189181970.636 |
| 3945 | 114432965610.049 |
| 3946 | 112144306297.848 |
| 3947 | 109901420171.891 |
| 3948 | 112099448575.329 |
| 3949 | 114341437546.836 |
| 3950 | 116628266297.772 |
| 3951 | 114295700971.817 |
| 3952 | 116581614991.253 |
| 3953 | 114249982691.428 |
| 3954 | 116534982345.257 |
| 3955 | 118865681992.162 |
| 3956 | 116488368352.319 |
| 3957 | 118818135719.365 |
| 3958 | 121194498433.752 |
| 3959 | 123618388402.427 |
| 3960 | 121146020634.379 |
| 3961 | 123568941047.066 |
| 3962 | 126040319868.008 |
| 3963 | 128561126265.368 |
| 3964 | 125989903740.06 |
| 3965 | 128509701814.862 |
| 3966 | 125939507778.564 |
| 3967 | 128458297934.136 |
| 3968 | 131027463892.818 |
| 3969 | 133648013170.675 |
| 3970 | 136320973434.088 |
| 3971 | 139047392902.77 |
| 3972 | 141828340760.825 |
| 3973 | 144664907576.042 |
| 3974 | 147558205727.563 |
| 3975 | 144607041613.012 |
| 3976 | 147499182445.272 |
| 3977 | 144549198796.366 |
| 3978 | 141658214820.439 |
| 3979 | 138825050524.03 |
| 3980 | 136048549513.55 |
| 3981 | 138769520503.821 |
| 3982 | 135994130093.744 |
| 3983 | 138714012695.619 |
| 3984 | 141488292949.531 |
| 3985 | 144318058808.522 |
| 3986 | 141431697632.352 |
| 3987 | 138603063679.705 |
| 3988 | 135831002406.111 |
| 3989 | 133114382357.988 |
| 3990 | 130452094710.829 |
| 3991 | 133061136605.045 |
| 3992 | 130399913872.944 |
| 3993 | 133007912150.403 |
| 3994 | 135668070393.411 |
| 3995 | 138381431801.279 |
| 3996 | 141149060437.305 |
| 3997 | 143972041646.051 |
| 3998 | 141092600813.13 |
| 3999 | 143914452829.393 |
| 4000 | 141036163772.805 |
| 4001 | 138215440497.349 |
| 4002 | 140979749307.296 |
| 4003 | 143799344293.442 |
| 4004 | 146675331179.31 |
| 4005 | 149608837802.897 |
| 4006 | 152601014558.955 |
| 4007 | 155653034850.134 |
| 4008 | 158766095547.136 |
| 4009 | 161941417458.08 |
| 4010 | 165180245807.241 |
| 4011 | 168483850723.385 |
| 4012 | 165114173708.918 |
| 4013 | 168416457183.096 |
| 4014 | 171784786326.758 |
| 4015 | 175220482053.293 |
| 4016 | 178724891694.359 |
| 4017 | 182299389528.246 |
| 4018 | 178653401737.681 |
| 4019 | 182226469772.435 |
| 4020 | 185870999167.884 |
| 4021 | 182153579184.526 |
| 4022 | 185796650768.216 |
| 4023 | 182080717752.852 |
| 4024 | 178439103397.795 |
| 4025 | 174870321329.839 |
| 4026 | 178367727756.436 |
| 4027 | 174800373201.307 |
| 4028 | 171304365737.281 |
| 4029 | 167878278422.535 |
| 4030 | 171235843990.986 |
| 4031 | 174660560870.806 |
| 4032 | 178153772088.222 |
| 4033 | 181716847529.986 |
| 4034 | 178082510579.387 |
| 4035 | 174520860367.799 |
| 4036 | 171030443160.443 |
| 4037 | 167609834297.234 |
| 4038 | 170962030983.179 |
| 4039 | 167542790363.515 |
| 4040 | 170893646170.785 |
| 4041 | 167475773247.37 |
| 4042 | 164126257782.422 |
| 4043 | 167408782938.071 |
| 4044 | 164060607279.309 |
| 4045 | 167341819424.896 |
| 4046 | 163994983036.398 |
| 4047 | 167274882697.126 |
| 4048 | 170620380351.068 |
| 4049 | 167207972744.047 |
| 4050 | 170552132198.928 |
| 4051 | 167141089554.949 |
| 4052 | 170483911346.048 |
| 4053 | 173893589572.969 |
| 4054 | 177371461364.428 |
| 4055 | 173824032137.14 |
| 4056 | 177300512779.883 |
| 4057 | 173754502524.285 |
| 4058 | 177229592574.771 |
| 4059 | 180774184426.266 |
| 4060 | 184389668114.791 |
| 4061 | 188077461477.087 |
| 4062 | 191839010706.629 |
| 4063 | 188002230492.497 |
| 4064 | 191762275102.346 |
| 4065 | 195597520604.393 |
| 4066 | 191685570192.306 |
| 4067 | 187851858788.459 |
| 4068 | 184094821612.69 |
| 4069 | 187776718044.944 |
| 4070 | 191532252405.843 |
| 4071 | 195362897453.96 |
| 4072 | 199270155403.039 |
| 4073 | 203255558511.1 |
| 4074 | 207320669681.322 |
| 4075 | 203174256287.695 |
| 4076 | 207237741413.449 |
| 4077 | 211382496241.718 |
| 4078 | 215610146166.553 |
| 4079 | 211297943243.222 |
| 4080 | 207071984378.357 |
| 4081 | 202930544690.79 |
| 4082 | 198871933796.974 |
| 4083 | 202849372472.914 |
| 4084 | 198792385023.455 |
| 4085 | 202768232723.924 |
| 4086 | 206823597378.403 |
| 4087 | 202687125430.835 |
| 4088 | 198633382922.218 |
| 4089 | 202606050580.663 |
| 4090 | 206658171592.276 |
| 4091 | 202525008160.43 |
| 4092 | 198474507997.222 |
| 4093 | 194505017837.277 |
| 4094 | 198395118194.023 |
| 4095 | 202363020557.903 |
| 4096 | 206410280969.061 |
| 4097 | 202282075349.68 |
| 4098 | 206327716856.674 |
| 4099 | 210454271193.807 |
| 4100 | 214663356617.683 |
| 4101 | 210370089485.33 |
| 4102 | 214577491275.036 |
| 4103 | 210285941449.535 |
| 4104 | 206080222620.545 |
| 4105 | 210201827072.956 |
| 4106 | 214405863614.415 |
| 4107 | 218693980886.703 |
| 4108 | 214320101268.97 |
| 4109 | 218606503294.348 |
| 4110 | 214234373228.461 |
| 4111 | 218519060693.031 |
| 4112 | 222889441906.891 |
| 4113 | 227347230745.029 |
| 4114 | 231894175359.93 |
| 4115 | 236532058867.128 |
| 4116 | 241262700044.471 |
| 4117 | 246087954045.36 |
| 4118 | 251009713126.267 |
| 4119 | 256029907388.793 |
| 4120 | 250909309241.017 |
| 4121 | 245891123056.197 |
| 4122 | 250808945517.32 |
| 4123 | 255825124427.667 |
| 4124 | 250708621939.114 |
| 4125 | 255722794377.896 |
| 4126 | 260837250265.454 |
| 4127 | 266053995270.763 |
| 4128 | 271375075176.178 |
| 4129 | 276802576679.702 |
| 4130 | 282338628213.296 |
| 4131 | 276691855649.03 |
| 4132 | 271158018536.049 |
| 4133 | 276581178906.77 |
| 4134 | 282112802484.906 |
| 4135 | 276470546435.207 |
| 4136 | 281999957363.912 |
| 4137 | 287639956511.19 |
| 4138 | 281887157380.966 |
| 4139 | 276249414233.347 |
| 4140 | 281774402518.014 |
| 4141 | 287409890568.374 |
| 4142 | 281661692757.006 |
| 4143 | 287294926612.147 |
| 4144 | 281549028079.904 |
| 4145 | 287180008641.502 |
| 4146 | 281436408468.672 |
| 4147 | 287065136638.045 |
| 4148 | 292806439370.806 |
| 4149 | 286950310583.39 |
| 4150 | 292689316795.058 |
| 4151 | 286835530459.157 |
| 4152 | 281098819849.973 |
| 4153 | 286720796246.973 |
| 4154 | 280986380322.033 |
| 4155 | 275366652715.593 |
| 4156 | 280873985769.905 |
| 4157 | 286491465485.303 |
| 4158 | 280761636175.597 |
| 4159 | 275146403452.085 |
| 4160 | 280649331521.126 |
| 4161 | 286262318151.549 |
| 4162 | 291987564514.58 |
| 4163 | 297827315804.872 |
| 4164 | 303783862120.969 |
| 4165 | 297708184878.55 |
| 4166 | 291754021180.979 |
| 4167 | 285918940757.359 |
| 4168 | 280200561942.212 |
| 4169 | 274596550703.368 |
| 4170 | 269104619689.3 |
| 4171 | 274486712083.086 |
| 4172 | 279976446324.748 |
| 4173 | 285575975251.243 |
| 4174 | 291287494756.268 |
| 4175 | 297113244651.393 |
| 4176 | 291170979758.365 |
| 4177 | 296994399353.533 |
| 4178 | 291054511366.462 |
| 4179 | 296875601593.791 |
| 4180 | 302813113625.667 |
| 4181 | 308869375898.18 |
| 4182 | 315046763416.144 |
| 4183 | 308745828147.821 |
| 4184 | 302570911584.865 |
| 4185 | 296519493353.167 |
| 4186 | 290589103486.104 |
| 4187 | 296400885555.826 |
| 4188 | 290472867844.71 |
| 4189 | 296282325201.604 |
| 4190 | 290356678697.572 |
| 4191 | 296163812271.523 |
| 4192 | 290240536026.093 |
| 4193 | 284435725305.571 |
| 4194 | 278747010799.459 |
| 4195 | 273172070583.47 |
| 4196 | 267708629171.801 |
| 4197 | 273062801755.237 |
| 4198 | 267601545720.132 |
| 4199 | 262249514805.729 |
| 4200 | 267494505101.844 |
| 4201 | 272844395203.881 |
| 4202 | 267387507299.803 |
| 4203 | 262039757153.807 |
| 4204 | 256798962010.731 |
| 4205 | 251662982770.516 |
| 4206 | 246629723115.106 |
| 4207 | 241697128652.804 |
| 4208 | 236863186079.748 |
| 4209 | 241600449801.343 |
| 4210 | 236768440805.316 |
| 4211 | 232033071989.21 |
| 4212 | 227392410549.425 |
| 4213 | 222844562338.437 |
| 4214 | 218387671091.668 |
| 4215 | 222755424513.502 |
| 4216 | 227210533003.772 |
| 4217 | 231754743663.847 |
| 4218 | 236389838537.124 |
| 4219 | 241117635307.866 |
| 4220 | 236295282601.709 |
| 4221 | 241021188253.743 |
| 4222 | 236200764488.668 |
| 4223 | 231476749198.895 |
| 4224 | 236106284182.873 |
| 4225 | 231384158499.216 |
| 4226 | 236011841669.2 |
| 4227 | 231291604835.816 |
| 4228 | 226665772739.1 |
| 4229 | 231199088193.882 |
| 4230 | 226575106430.004 |
| 4231 | 231106608558.604 |
| 4232 | 226484476387.432 |
| 4233 | 221954786859.683 |
| 4234 | 226393882596.877 |
| 4235 | 221866004944.939 |
| 4236 | 226303325043.838 |
| 4237 | 221777258542.961 |
| 4238 | 217341713372.102 |
| 4239 | 212994879104.66 |
| 4240 | 217254776686.753 |
| 4241 | 221599872220.488 |
| 4242 | 226031869664.898 |
| 4243 | 230552507058.196 |
| 4244 | 225941456917.032 |
| 4245 | 230460286055.373 |
| 4246 | 225851080334.265 |
| 4247 | 221334058727.58 |
| 4248 | 216907377553.028 |
| 4249 | 212569230001.968 |
| 4250 | 216820614602.007 |
| 4251 | 212484202309.967 |
| 4252 | 208234518263.768 |
| 4253 | 212399208629.043 |
| 4254 | 208151224456.462 |
| 4255 | 212314248945.592 |
| 4256 | 216560533924.503 |
| 4257 | 220891744602.993 |
| 4258 | 225309579495.053 |
| 4259 | 229815771084.954 |
| 4260 | 225219455663.255 |
| 4261 | 229723844776.52 |
| 4262 | 225129367880.99 |
| 4263 | 229631955238.61 |
| 4264 | 225039316133.838 |
| 4265 | 229540102456.514 |
| 4266 | 224949300407.384 |
| 4267 | 229448286415.532 |
| 4268 | 224859320687.221 |
| 4269 | 229356507100.966 |
| 4270 | 233943637242.985 |
| 4271 | 238622509987.845 |
| 4272 | 243394960187.601 |
| 4273 | 248262859391.354 |
| 4274 | 253228116579.181 |
| 4275 | 258292678910.764 |
| 4276 | 253126825332.549 |
| 4277 | 258189361839.2 |
| 4278 | 263353149075.984 |
| 4279 | 268620212057.504 |
| 4280 | 273992616298.654 |
| 4281 | 279472468624.627 |
| 4282 | 285061917997.119 |
| 4283 | 290763156357.062 |
| 4284 | 284947893229.92 |
| 4285 | 290646851094.519 |
| 4286 | 284833914072.628 |
| 4287 | 290530592354.081 |
| 4288 | 284719980506.999 |
| 4289 | 290414380117.139 |
| 4290 | 284606092514.797 |
| 4291 | 278913970664.501 |
| 4292 | 284492250077.791 |
| 4293 | 278802405076.235 |
| 4294 | 284378453177.76 |
| 4295 | 278690884114.205 |
| 4296 | 284264701796.489 |
| 4297 | 289949995832.418 |
| 4298 | 295748995749.067 |
| 4299 | 301663975664.048 |
| 4300 | 295630696150.767 |
| 4301 | 301543310073.782 |
| 4302 | 295512443872.307 |
| 4303 | 301422692749.753 |
| 4304 | 307451146604.748 |
| 4305 | 313600169536.843 |
| 4306 | 307328166146.106 |
| 4307 | 313474729469.028 |
| 4308 | 319744224058.409 |
| 4309 | 326139108539.577 |
| 4310 | 332661890710.368 |
| 4311 | 326008652896.161 |
| 4312 | 332528825954.084 |
| 4313 | 325878249435.003 |
| 4314 | 319360684446.303 |
| 4315 | 325747898135.229 |
| 4316 | 319232940172.524 |
| 4317 | 325617598975.975 |
| 4318 | 319105246996.455 |
| 4319 | 312723142056.526 |
| 4320 | 306468679215.395 |
| 4321 | 312598052799.703 |
| 4322 | 318850013855.697 |
| 4323 | 312473013578.584 |
| 4324 | 318722473850.155 |
| 4325 | 325096923327.158 |
| 4326 | 331598861793.701 |
| 4327 | 324966884557.827 |
| 4328 | 318467546866.671 |
| 4329 | 324836897804.004 |
| 4330 | 331333635760.084 |
| 4331 | 337960308475.286 |
| 4332 | 331201102305.78 |
| 4333 | 337825124351.896 |
| 4334 | 331068621864.858 |
| 4335 | 324447249427.561 |
| 4336 | 330936194416.112 |
| 4337 | 337554918304.434 |
| 4338 | 344306016670.523 |
| 4339 | 351192137003.933 |
| 4340 | 358215979744.012 |
| 4341 | 351051660149.132 |
| 4342 | 358072693352.115 |
| 4343 | 365234147219.157 |
| 4344 | 357929464274.774 |
| 4345 | 365088053560.269 |
| 4346 | 357786292489.064 |
| 4347 | 364942018338.845 |
| 4348 | 357643177972.068 |
| 4349 | 364796041531.509 |
| 4350 | 357500120700.879 |
| 4351 | 364650123114.897 |
| 4352 | 357357120652.599 |
| 4353 | 350209978239.547 |
| 4354 | 343205778674.756 |
| 4355 | 350069894248.251 |
| 4356 | 357071292133.216 |
| 4357 | 349929866290.552 |
| 4358 | 356928463616.363 |
| 4359 | 349789894344.036 |
| 4360 | 342794096457.155 |
| 4361 | 349649978386.298 |
| 4362 | 342656978818.572 |
| 4363 | 349510118394.943 |
| 4364 | 356500320762.842 |
| 4365 | 363630327178.099 |
| 4366 | 356357720634.537 |
| 4367 | 349230566221.846 |
| 4368 | 356215177546.283 |
| 4369 | 363339481097.21 |
| 4370 | 356072691475.265 |
| 4371 | 363194145304.77 |
| 4372 | 355930262398.675 |
| 4373 | 363048867646.648 |
| 4374 | 355787890293.715 |
| 4375 | 362903648099.59 |
| 4376 | 370161721061.581 |
| 4377 | 377564955482.813 |
| 4378 | 370013656373.157 |
| 4379 | 377413929500.62 |
| 4380 | 384962208090.632 |
| 4381 | 392661452252.445 |
| 4382 | 400514681297.494 |
| 4383 | 392504387671.544 |
| 4384 | 400354475424.975 |
| 4385 | 392347385916.475 |
| 4386 | 384500438198.146 |
| 4387 | 392190446962.109 |
| 4388 | 400034255901.351 |
| 4389 | 408034941019.378 |
| 4390 | 416195639839.766 |
| 4391 | 407871727042.97 |
| 4392 | 416029161583.83 |
| 4393 | 424349744815.506 |
| 4394 | 415862749919.196 |
| 4395 | 407545494920.812 |
| 4396 | 415696404819.229 |
| 4397 | 407382476722.844 |
| 4398 | 415530126257.301 |
| 4399 | 423840728782.447 |
| 4400 | 415363914206.798 |
| 4401 | 423671192490.934 |
| 4402 | 432144616340.752 |
| 4403 | 440787508667.568 |
| 4404 | 449603258840.919 |
| 4405 | 458595324017.737 |
| 4406 | 467767230498.092 |
| 4407 | 477122575108.054 |
| 4408 | 486665026610.215 |
| 4409 | 476931726078.011 |
| 4410 | 486470360599.571 |
| 4411 | 496199767811.562 |
| 4412 | 506123763167.794 |
| 4413 | 496001287904.438 |
| 4414 | 505921313662.526 |
| 4415 | 495802887389.276 |
| 4416 | 505718945137.061 |
| 4417 | 515833324039.803 |
| 4418 | 505516657559.007 |
| 4419 | 515626990710.187 |
| 4420 | 525939530524.39 |
| 4421 | 536458321134.878 |
| 4422 | 547187487557.576 |
| 4423 | 536243737806.424 |
| 4424 | 525518863050.296 |
| 4425 | 536029240311.302 |
| 4426 | 525308655505.076 |
| 4427 | 514802482394.974 |
| 4428 | 504506432747.075 |
| 4429 | 494416304092.133 |
| 4430 | 484527978010.291 |
| 4431 | 474837418450.085 |
| 4432 | 465340670081.083 |
| 4433 | 474647483482.705 |
| 4434 | 484140433152.359 |
| 4435 | 493823241815.406 |
| 4436 | 503699706651.714 |
| 4437 | 493625712518.68 |
| 4438 | 503498226769.053 |
| 4439 | 513568191304.434 |
| 4440 | 503296827478.346 |
| 4441 | 493230890928.779 |
| 4442 | 503095508747.354 |
| 4443 | 493033598572.407 |
| 4444 | 502894270543.855 |
| 4445 | 512952155954.733 |
| 4446 | 502693112835.638 |
| 4447 | 492639250578.925 |
| 4448 | 502492035590.504 |
| 4449 | 492442194878.694 |
| 4450 | 502291038776.267 |
| 4451 | 512336859551.793 |
| 4452 | 502090122360.757 |
| 4453 | 512131924807.972 |
| 4454 | 522374563304.132 |
| 4455 | 511927072038.049 |
| 4456 | 501688530597.288 |
| 4457 | 511722301209.234 |
| 4458 | 521956747233.418 |
| 4459 | 532395882178.087 |
| 4460 | 543043799821.648 |
| 4461 | 553904675818.081 |
| 4462 | 564982769334.443 |
| 4463 | 576282424721.132 |
| 4464 | 587808073215.554 |
| 4465 | 576051911751.243 |
| 4466 | 587572949986.268 |
| 4467 | 599324408985.994 |
| 4468 | 611310897165.713 |
| 4469 | 623537115109.028 |
| 4470 | 611066372806.847 |
| 4471 | 623287700262.984 |
| 4472 | 610821946257.725 |
| 4473 | 623038385182.879 |
| 4474 | 610577617479.222 |
| 4475 | 598366065129.637 |
| 4476 | 610333386432.23 |
| 4477 | 622540054160.874 |
| 4478 | 610089253077.657 |
| 4479 | 597887468016.104 |
| 4480 | 609845217376.426 |
| 4481 | 622042121723.954 |
| 4482 | 634482964158.434 |
| 4483 | 621793304875.265 |
| 4484 | 634229170972.77 |
| 4485 | 646913754392.226 |
| 4486 | 633975479304.381 |
| 4487 | 621295969718.293 |
| 4488 | 633721889112.659 |
| 4489 | 646396326894.912 |
| 4490 | 633468400357.014 |
| 4491 | 646137768364.155 |
| 4492 | 659060523731.438 |
| 4493 | 672241734206.066 |
| 4494 | 658796899521.945 |
| 4495 | 671972837512.384 |
| 4496 | 658533380762.136 |
| 4497 | 671704048377.379 |
| 4498 | 658269967409.831 |
| 4499 | 671435366758.028 |
| 4500 | 658006659422.867 |
| 4501 | 644846526234.41 |
| 4502 | 657743456759.098 |
| 4503 | 670898325894.28 |
| 4504 | 657480359376.395 |
| 4505 | 670629966563.923 |
| 4506 | 684042565895.201 |
| 4507 | 697723417213.105 |
| 4508 | 711677885557.367 |
| 4509 | 725911443268.514 |
| 4510 | 740429672133.885 |
| 4511 | 755238265576.562 |
| 4512 | 740133500265.031 |
| 4513 | 754936170270.332 |
| 4514 | 770034893675.739 |
| 4515 | 785435591549.253 |
| 4516 | 769726879718.268 |
| 4517 | 785121417312.634 |
| 4518 | 800823845658.886 |
| 4519 | 784807368745.709 |
| 4520 | 800503516120.623 |
| 4521 | 784493445798.21 |
| 4522 | 800183314714.174 |
| 4523 | 816186981008.458 |
| 4524 | 832510720628.627 |
| 4525 | 849160935041.2 |
| 4526 | 866144153742.024 |
| 4527 | 848821270667.183 |
| 4528 | 831844845253.839 |
| 4529 | 815207948348.763 |
| 4530 | 831512107315.738 |
| 4531 | 814881865169.423 |
| 4532 | 831179502472.811 |
| 4533 | 847803092522.268 |
| 4534 | 864759154372.713 |
| 4535 | 847463971285.259 |
| 4536 | 864413250710.964 |
| 4537 | 847124985696.745 |
| 4538 | 830182485982.81 |
| 4539 | 813578836263.154 |
| 4540 | 829850412988.417 |
| 4541 | 813253404728.648 |
| 4542 | 829518472823.221 |
| 4543 | 846108842279.686 |
| 4544 | 863031019125.279 |
| 4545 | 880291639507.785 |
| 4546 | 862685806717.629 |
| 4547 | 845432090583.277 |
| 4548 | 862340732394.942 |
| 4549 | 845093917747.044 |
| 4550 | 861995796101.984 |
| 4551 | 844755880179.945 |
| 4552 | 861650997783.544 |
| 4553 | 844417977827.873 |
| 4554 | 861306337384.43 |
| 4555 | 844080210636.742 |
| 4556 | 827198606424.007 |
| 4557 | 843742578552.487 |
| 4558 | 826867726981.437 |
| 4559 | 810330372441.808 |
| 4560 | 794123764992.972 |
| 4561 | 778241289693.113 |
| 4562 | 793806115486.975 |
| 4563 | 809682237796.715 |
| 4564 | 825875882552.65 |
| 4565 | 842393400203.702 |
| 4566 | 859241268207.776 |
| 4567 | 876426093571.932 |
| 4568 | 858897571700.493 |
| 4569 | 841719620266.483 |
| 4570 | 858554012671.813 |
| 4571 | 875725092925.249 |
| 4572 | 893239594783.754 |
| 4573 | 875374802888.079 |
| 4574 | 892882298945.841 |
| 4575 | 875024652966.924 |
| 4576 | 892525146026.262 |
| 4577 | 910375648946.787 |
| 4578 | 892168135967.852 |
| 4579 | 910011498687.209 |
| 4580 | 891811268713.465 |
| 4581 | 873975043339.195 |
| 4582 | 891454544205.979 |
| 4583 | 873625453321.86 |
| 4584 | 891097962388.297 |
| 4585 | 873276003140.531 |
| 4586 | 855810483077.72 |
| 4587 | 838694273416.166 |
| 4588 | 855468158884.489 |
| 4589 | 872577522062.179 |
| 4590 | 890029072503.422 |
| 4591 | 872228491053.354 |
| 4592 | 854783921232.287 |
| 4593 | 837688242807.641 |
| 4594 | 854442007663.794 |
| 4595 | 837353167510.518 |
| 4596 | 854100230860.728 |
| 4597 | 837018226243.514 |
| 4598 | 820277861718.644 |
| 4599 | 836683418953.016 |
| 4600 | 819949750573.956 |
| 4601 | 836348745585.435 |
| 4602 | 819621770673.726 |
| 4603 | 803229335260.252 |
| 4604 | 819293921965.457 |
| 4605 | 802908043526.148 |
| 4606 | 818966204396.671 |
| 4607 | 802586880308.737 |
| 4608 | 786535142702.563 |
| 4609 | 802265845556.614 |
| 4610 | 818311162467.746 |
| 4611 | 801944939218.391 |
| 4612 | 817983838002.759 |
| 4613 | 834343514762.814 |
| 4614 | 851030385058.07 |
| 4615 | 834009777356.909 |
| 4616 | 817329581809.771 |
| 4617 | 800982990173.575 |
| 4618 | 784963330370.104 |
| 4619 | 769264063762.702 |
| 4620 | 784649345037.956 |
| 4621 | 800342331938.715 |
| 4622 | 816349178577.489 |
| 4623 | 800022195005.939 |
| 4624 | 816022638906.058 |
| 4625 | 832343091684.179 |
| 4626 | 848989953517.863 |
| 4627 | 865969752588.22 |
| 4628 | 883289147639.985 |
| 4629 | 900954930592.784 |
| 4630 | 882935831980.929 |
| 4631 | 900594548620.547 |
| 4632 | 882582657648.136 |
| 4633 | 864931004495.174 |
| 4634 | 882229624585.077 |
| 4635 | 899874217076.779 |
| 4636 | 917871701418.314 |
| 4637 | 936229135446.68 |
| 4638 | 954953718155.614 |
| 4639 | 935854643792.502 |
| 4640 | 917137550916.652 |
| 4641 | 898794799898.319 |
| 4642 | 916770695896.285 |
| 4643 | 898435281978.36 |
| 4644 | 880466576338.792 |
| 4645 | 898075907865.568 |
| 4646 | 916037426022.88 |
| 4647 | 897716677502.422 |
| 4648 | 879762343952.373 |
| 4649 | 862167097073.326 |
| 4650 | 879410439014.793 |
| 4651 | 896998647795.088 |
| 4652 | 914938620750.99 |
| 4653 | 896639848335.97 |
| 4654 | 914572645302.69 |
| 4655 | 896281192396.636 |
| 4656 | 914206816244.569 |
| 4657 | 932490952569.46 |
| 4658 | 951140771620.849 |
| 4659 | 970163587053.266 |
| 4660 | 989566858794.332 |
| 4661 | 1009358195970.22 |
| 4662 | 989171032050.814 |
| 4663 | 969387611409.797 |
| 4664 | 988775363637.993 |
| 4665 | 1008550870910.75 |
| 4666 | 988379853492.538 |
| 4667 | 1008147450562.39 |
| 4668 | 1028310399573.64 |
| 4669 | 1048876607565.11 |
| 4670 | 1069854139716.41 |
| 4671 | 1091251222510.74 |
| 4672 | 1113076246960.95 |
| 4673 | 1090814722021.74 |
| 4674 | 1068998427581.3 |
| 4675 | 1090378396132.93 |
| 4676 | 1112185964055.59 |
| 4677 | 1134429683336.7 |
| 4678 | 1111741089669.96 |
| 4679 | 1133975911463.36 |
| 4680 | 1156655429692.63 |
| 4681 | 1179788538286.48 |
| 4682 | 1203384309052.21 |
| 4683 | 1227451995233.26 |
| 4684 | 1252001035137.92 |
| 4685 | 1277041055840.68 |
| 4686 | 1302581876957.49 |
| 4687 | 1276530239418.34 |
| 4688 | 1250999634629.98 |
| 4689 | 1225979641937.38 |
| 4690 | 1250499234776.12 |
| 4691 | 1225489250080.6 |
| 4692 | 1200979465078.99 |
| 4693 | 1176959875777.41 |
| 4694 | 1153420678261.86 |
| 4695 | 1130352264696.63 |
| 4696 | 1152959309990.56 |
| 4697 | 1176018496190.37 |
| 4698 | 1152498126266.56 |
| 4699 | 1175548088791.89 |
| 4700 | 1199059050567.73 |
| 4701 | 1223040231579.08 |
| 4702 | 1247501036210.67 |
| 4703 | 1272451056934.88 |
| 4704 | 1297900078073.58 |
| 4705 | 1323858079635.05 |
| 4706 | 1350335241227.75 |
| 4707 | 1323328536403.19 |
| 4708 | 1349795107131.26 |
| 4709 | 1322799204988.63 |
| 4710 | 1349255189088.41 |
| 4711 | 1322270085306.64 |
| 4712 | 1348715487012.77 |
| 4713 | 1375689796753.03 |
| 4714 | 1403203592688.09 |
| 4715 | 1431267664541.85 |
| 4716 | 1459893017832.69 |
| 4717 | 1489090878189.34 |
| 4718 | 1459309060625.55 |
| 4719 | 1430122879413.04 |
| 4720 | 1458725337001.3 |
| 4721 | 1429550830261.28 |
| 4722 | 1458141846866.5 |
| 4723 | 1487304683803.83 |
| 4724 | 1517050777479.91 |
| 4725 | 1547391793029.51 |
| 4726 | 1516443957168.92 |
| 4727 | 1546772836312.3 |
| 4728 | 1577708293038.54 |
| 4729 | 1609262458899.31 |
| 4730 | 1577077209721.33 |
| 4731 | 1608618753915.75 |
| 4732 | 1576446378837.44 |
| 4733 | 1544917451260.69 |
| 4734 | 1514019102235.47 |
| 4735 | 1483738720190.76 |
| 4736 | 1454063945786.95 |
| 4737 | 1483145224702.69 |
| 4738 | 1512808129196.74 |
| 4739 | 1543064291780.68 |
| 4740 | 1512203005945.06 |
| 4741 | 1542447066063.97 |
| 4742 | 1573296007385.24 |
| 4743 | 1541830087237.54 |
| 4744 | 1510993485492.79 |
| 4745 | 1541213355202.64 |
| 4746 | 1572037622306.7 |
| 4747 | 1540596869860.56 |
| 4748 | 1571408807257.77 |
| 4749 | 1539980631112.62 |
| 4750 | 1570780243734.87 |
| 4751 | 1539364638860.17 |
| 4752 | 1570151931637.38 |
| 4753 | 1538748893004.63 |
| 4754 | 1569523870864.72 |
| 4755 | 1600914348282.02 |
| 4756 | 1632932635247.66 |
| 4757 | 1600273982542.7 |
| 4758 | 1568268502891.85 |
| 4759 | 1599633872949.69 |
| 4760 | 1631626550408.68 |
| 4761 | 1664259081416.85 |
| 4762 | 1630973899788.52 |
| 4763 | 1663593377784.29 |
| 4764 | 1630321510228.6 |
| 4765 | 1597715080024.03 |
| 4766 | 1629669381624.51 |
| 4767 | 1597075993992.02 |
| 4768 | 1629017513871.86 |
| 4769 | 1661597864149.3 |
| 4770 | 1628365906866.31 |
| 4771 | 1595798588728.99 |
| 4772 | 1627714560503.57 |
| 4773 | 1660268851713.64 |
| 4774 | 1693474228747.91 |
| 4775 | 1659604744172.95 |
| 4776 | 1692796839056.41 |
| 4777 | 1658940902275.28 |
| 4778 | 1692119720320.79 |
| 4779 | 1658277325914.37 |
| 4780 | 1691442872432.66 |
| 4781 | 1657614014984.01 |
| 4782 | 1690766295283.69 |
| 4783 | 1724581621189.36 |
| 4784 | 1690089988765.57 |
| 4785 | 1723891788540.88 |
| 4786 | 1758369624311.7 |
| 4787 | 1723202231825.47 |
| 4788 | 1688738187188.96 |
| 4789 | 1654963423445.18 |
| 4790 | 1688062691914.08 |
| 4791 | 1721823945752.36 |
| 4792 | 1687387466837.32 |
| 4793 | 1721135216174.06 |
| 4794 | 1755557920497.55 |
| 4795 | 1720446762087.59 |
| 4796 | 1686037826845.84 |
| 4797 | 1719758583382.76 |
| 4798 | 1685363411715.1 |
| 4799 | 1719070679949.41 |
| 4800 | 1684689266350.42 |
| 4801 | 1650995481023.41 |
| 4802 | 1684015390643.88 |
| 4803 | 1650335082831 |
| 4804 | 1683341784487.62 |
| 4805 | 1649674948797.87 |
| 4806 | 1682668447773.83 |
| 4807 | 1649015078818.35 |
| 4808 | 1616034777241.98 |
| 4809 | 1648355472786.82 |
| 4810 | 1615388363331.08 |
| 4811 | 1583080596064.46 |
| 4812 | 1551418984143.17 |
| 4813 | 1582447363826.04 |
| 4814 | 1614096311102.56 |
| 4815 | 1581814384880.51 |
| 4816 | 1613450672578.12 |
| 4817 | 1645719686029.68 |
| 4818 | 1612805292309.09 |
| 4819 | 1645061398155.27 |
| 4820 | 1677962626118.37 |
| 4821 | 1711521878640.74 |
| 4822 | 1745752316213.56 |
| 4823 | 1710837269889.28 |
| 4824 | 1676620524491.5 |
| 4825 | 1710152934981.33 |
| 4826 | 1675949876281.7 |
| 4827 | 1642430878756.07 |
| 4828 | 1675279496331.19 |
| 4829 | 1708785086257.81 |
| 4830 | 1742960787982.97 |
| 4831 | 1708101572223.31 |
| 4832 | 1673939540778.84 |
| 4833 | 1707418331594.42 |
| 4834 | 1673269964962.53 |
| 4835 | 1639804565663.28 |
| 4836 | 1607008474350.02 |
| 4837 | 1639148643837.02 |
| 4838 | 1671931616713.76 |
| 4839 | 1705370249048.03 |
| 4840 | 1739477654028.99 |
| 4841 | 1774267207109.57 |
| 4842 | 1738781862967.38 |
| 4843 | 1773557500226.73 |
| 4844 | 1738086350222.19 |
| 4845 | 1703324623217.75 |
| 4846 | 1737391115682.1 |
| 4847 | 1772138937995.75 |
| 4848 | 1736696159235.83 |
| 4849 | 1771430082420.55 |
| 4850 | 1736001480772.14 |
| 4851 | 1770721510387.58 |
| 4852 | 1806135940595.33 |
| 4853 | 1770013221783.42 |
| 4854 | 1734612957347.76 |
| 4855 | 1769305216494.71 |
| 4856 | 1804691320824.61 |
| 4857 | 1840785147241.1 |
| 4858 | 1803969444296.28 |
| 4859 | 1840048833182.2 |
| 4860 | 1803247856518.56 |
| 4861 | 1839312813648.93 |
| 4862 | 1876099069921.91 |
| 4863 | 1913621051320.35 |
| 4864 | 1875348630293.94 |
| 4865 | 1912855602899.82 |
| 4866 | 1951112714957.81 |
| 4867 | 1990134969256.97 |
| 4868 | 2029937668642.11 |
| 4869 | 1989338915269.27 |
| 4870 | 1949552136963.88 |
| 4871 | 1910561094224.6 |
| 4872 | 1872349872340.11 |
| 4873 | 1834902874893.31 |
| 4874 | 1798204817395.44 |
| 4875 | 1834168913743.35 |
| 4876 | 1797485535468.49 |
| 4877 | 1761535824759.12 |
| 4878 | 1796766541254.3 |
| 4879 | 1832701872079.38 |
| 4880 | 1796047834637.8 |
| 4881 | 1760126877945.04 |
| 4882 | 1795329415503.94 |
| 4883 | 1831236003814.02 |
| 4884 | 1794611283737.74 |
| 4885 | 1830503509412.49 |
| 4886 | 1793893439224.24 |
| 4887 | 1758015570439.76 |
| 4888 | 1793175881848.55 |
| 4889 | 1829039399485.53 |
| 4890 | 1865620187475.24 |
| 4891 | 1902932591224.74 |
| 4892 | 1940991243049.24 |
| 4893 | 1979811067910.22 |
| 4894 | 1940214846552.02 |
| 4895 | 1979019143483.06 |
| 4896 | 2018599526352.72 |
| 4897 | 1978227535825.66 |
| 4898 | 1938662985109.15 |
| 4899 | 1899889725406.97 |
| 4900 | 1937887519915.11 |
| 4901 | 1976645270313.41 |
| 4902 | 1937112364907.14 |
| 4903 | 1975854612205.28 |
| 4904 | 2015371704449.39 |
| 4905 | 1975064270360.4 |
| 4906 | 2014565555767.61 |
| 4907 | 2054856866882.96 |
| 4908 | 2095954004220.62 |
| 4909 | 2137873084305.03 |
| 4910 | 2180630545991.13 |
| 4911 | 2224243156910.96 |
| 4912 | 2268728020049.18 |
| 4913 | 2314102580450.16 |
| 4914 | 2360384632059.16 |
| 4915 | 2407592324700.35 |
| 4916 | 2455744171194.35 |
| 4917 | 2504859054618.24 |
| 4918 | 2554956235710.6 |
| 4919 | 2606055360424.82 |
| 4920 | 2658176467633.31 |
| 4921 | 2711339996985.98 |
| 4922 | 2765566796925.7 |
| 4923 | 2710255460987.18 |
| 4924 | 2764460570206.93 |
| 4925 | 2819749781611.07 |
| 4926 | 2876144777243.29 |
| 4927 | 2818621881698.42 |
| 4928 | 2762249444064.45 |
| 4929 | 2707004455183.16 |
| 4930 | 2761144544286.83 |
| 4931 | 2705921653401.09 |
| 4932 | 2760040086469.11 |
| 4933 | 2815240888198.5 |
| 4934 | 2871545705962.47 |
| 4935 | 2928976620081.71 |
| 4936 | 2987556152483.35 |
| 4937 | 2927805029433.68 |
| 4938 | 2869248928845.01 |
| 4939 | 2811863950268.11 |
| 4940 | 2868101229273.47 |
| 4941 | 2925463253858.94 |
| 4942 | 2983972518936.12 |
| 4943 | 3043651969314.84 |
| 4944 | 3104525008701.14 |
| 4945 | 3166615508875.16 |
| 4946 | 3103283198697.66 |
| 4947 | 3165348862671.61 |
| 4948 | 3228655839925.04 |
| 4949 | 3293228956723.54 |
| 4950 | 3359093535858.01 |
| 4951 | 3291911665140.85 |
| 4952 | 3357749898443.67 |
| 4953 | 3424904896412.54 |
| 4954 | 3493402994340.79 |
| 4955 | 3423534934453.98 |
| 4956 | 3355064235764.9 |
| 4957 | 3287962951049.6 |
| 4958 | 3222203692028.61 |
| 4959 | 3286647765869.18 |
| 4960 | 3352380721186.57 |
| 4961 | 3285333106762.83 |
| 4962 | 3351039768898.09 |
| 4963 | 3418060564276.05 |
| 4964 | 3486421775561.57 |
| 4965 | 3416693340050.34 |
| 4966 | 3485027206851.35 |
| 4967 | 3554727750988.38 |
| 4968 | 3483633195968.61 |
| 4969 | 3413960532049.24 |
| 4970 | 3482239742690.22 |
| 4971 | 3551884537544.03 |
| 4972 | 3622922228294.91 |
| 4973 | 3695380672860.8 |
| 4974 | 3769288286318.02 |
| 4975 | 3844674052044.38 |
| 4976 | 3921567533085.27 |
| 4977 | 3843136182423.56 |
| 4978 | 3766273458775.09 |
| 4979 | 3841598927950.59 |
| 4980 | 3764766949391.58 |
| 4981 | 3840062288379.41 |
| 4982 | 3763261042611.82 |
| 4983 | 3838526263464.06 |
| 4984 | 3761755738194.78 |
| 4985 | 3686520623430.88 |
| 4986 | 3760251035899.5 |
| 4987 | 3685046015181.51 |
| 4988 | 3758746935485.14 |
| 4989 | 3833921874194.84 |
| 4990 | 3757243436710.95 |
| 4991 | 3832388305445.17 |
| 4992 | 3909036071554.07 |
| 4993 | 3987216792985.15 |
| 4994 | 4066961128844.85 |
| 4995 | 4148300351421.75 |
| 4996 | 4231266358450.19 |
| 4997 | 4315891685619.2 |
| 4998 | 4402209519331.57 |
| 4999 | 4490253709718.21 |